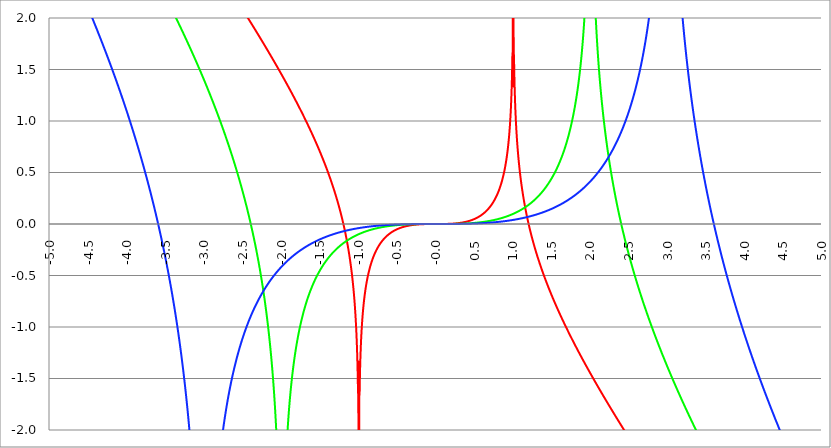
| Category | Series 1 | Series 0 | Series 2 |
|---|---|---|---|
| -5.0 | 4.797 | 4.153 | 2.921 |
| -4.995 | 4.792 | 4.147 | 2.913 |
| -4.99 | 4.787 | 4.141 | 2.905 |
| -4.985 | 4.782 | 4.135 | 2.897 |
| -4.98 | 4.776 | 4.129 | 2.889 |
| -4.975 | 4.771 | 4.123 | 2.881 |
| -4.97 | 4.766 | 4.117 | 2.874 |
| -4.965000000000001 | 4.761 | 4.111 | 2.866 |
| -4.960000000000001 | 4.756 | 4.105 | 2.858 |
| -4.955000000000001 | 4.75 | 4.099 | 2.85 |
| -4.950000000000001 | 4.745 | 4.093 | 2.842 |
| -4.945000000000001 | 4.74 | 4.087 | 2.834 |
| -4.940000000000001 | 4.735 | 4.081 | 2.826 |
| -4.935000000000001 | 4.73 | 4.075 | 2.818 |
| -4.930000000000001 | 4.724 | 4.069 | 2.81 |
| -4.925000000000002 | 4.719 | 4.063 | 2.802 |
| -4.920000000000002 | 4.714 | 4.057 | 2.794 |
| -4.915000000000002 | 4.709 | 4.051 | 2.786 |
| -4.910000000000002 | 4.703 | 4.045 | 2.778 |
| -4.905000000000002 | 4.698 | 4.039 | 2.77 |
| -4.900000000000002 | 4.693 | 4.033 | 2.762 |
| -4.895000000000002 | 4.688 | 4.027 | 2.754 |
| -4.890000000000002 | 4.683 | 4.021 | 2.746 |
| -4.885000000000002 | 4.677 | 4.015 | 2.738 |
| -4.880000000000002 | 4.672 | 4.009 | 2.73 |
| -4.875000000000003 | 4.667 | 4.003 | 2.722 |
| -4.870000000000003 | 4.662 | 3.997 | 2.714 |
| -4.865000000000003 | 4.656 | 3.991 | 2.706 |
| -4.860000000000003 | 4.651 | 3.985 | 2.698 |
| -4.855000000000003 | 4.646 | 3.979 | 2.69 |
| -4.850000000000003 | 4.641 | 3.973 | 2.682 |
| -4.845000000000003 | 4.636 | 3.967 | 2.674 |
| -4.840000000000003 | 4.63 | 3.961 | 2.666 |
| -4.835000000000003 | 4.625 | 3.955 | 2.658 |
| -4.830000000000004 | 4.62 | 3.949 | 2.65 |
| -4.825000000000004 | 4.615 | 3.943 | 2.641 |
| -4.820000000000004 | 4.609 | 3.937 | 2.633 |
| -4.815000000000004 | 4.604 | 3.931 | 2.625 |
| -4.810000000000004 | 4.599 | 3.925 | 2.617 |
| -4.805000000000004 | 4.594 | 3.919 | 2.609 |
| -4.800000000000004 | 4.589 | 3.913 | 2.6 |
| -4.795000000000004 | 4.583 | 3.907 | 2.592 |
| -4.790000000000004 | 4.578 | 3.901 | 2.584 |
| -4.785000000000004 | 4.573 | 3.895 | 2.576 |
| -4.780000000000004 | 4.568 | 3.888 | 2.568 |
| -4.775000000000004 | 4.562 | 3.882 | 2.559 |
| -4.770000000000004 | 4.557 | 3.876 | 2.551 |
| -4.765000000000005 | 4.552 | 3.87 | 2.543 |
| -4.760000000000005 | 4.547 | 3.864 | 2.534 |
| -4.755000000000005 | 4.542 | 3.858 | 2.526 |
| -4.750000000000005 | 4.536 | 3.852 | 2.518 |
| -4.745000000000005 | 4.531 | 3.846 | 2.51 |
| -4.740000000000005 | 4.526 | 3.84 | 2.501 |
| -4.735000000000005 | 4.521 | 3.834 | 2.493 |
| -4.730000000000005 | 4.515 | 3.828 | 2.485 |
| -4.725000000000006 | 4.51 | 3.822 | 2.476 |
| -4.720000000000006 | 4.505 | 3.816 | 2.468 |
| -4.715000000000006 | 4.5 | 3.809 | 2.459 |
| -4.710000000000006 | 4.494 | 3.803 | 2.451 |
| -4.705000000000006 | 4.489 | 3.797 | 2.443 |
| -4.700000000000006 | 4.484 | 3.791 | 2.434 |
| -4.695000000000006 | 4.479 | 3.785 | 2.426 |
| -4.690000000000006 | 4.473 | 3.779 | 2.417 |
| -4.685000000000007 | 4.468 | 3.773 | 2.409 |
| -4.680000000000007 | 4.463 | 3.767 | 2.4 |
| -4.675000000000007 | 4.458 | 3.761 | 2.392 |
| -4.670000000000007 | 4.453 | 3.754 | 2.383 |
| -4.665000000000007 | 4.447 | 3.748 | 2.375 |
| -4.660000000000007 | 4.442 | 3.742 | 2.366 |
| -4.655000000000007 | 4.437 | 3.736 | 2.358 |
| -4.650000000000007 | 4.432 | 3.73 | 2.349 |
| -4.645000000000007 | 4.426 | 3.724 | 2.341 |
| -4.640000000000008 | 4.421 | 3.718 | 2.332 |
| -4.635000000000008 | 4.416 | 3.712 | 2.323 |
| -4.630000000000008 | 4.411 | 3.705 | 2.315 |
| -4.625000000000008 | 4.405 | 3.699 | 2.306 |
| -4.620000000000008 | 4.4 | 3.693 | 2.297 |
| -4.615000000000008 | 4.395 | 3.687 | 2.289 |
| -4.610000000000008 | 4.39 | 3.681 | 2.28 |
| -4.605000000000008 | 4.384 | 3.675 | 2.271 |
| -4.600000000000008 | 4.379 | 3.668 | 2.263 |
| -4.595000000000009 | 4.374 | 3.662 | 2.254 |
| -4.590000000000009 | 4.369 | 3.656 | 2.245 |
| -4.585000000000009 | 4.363 | 3.65 | 2.237 |
| -4.580000000000009 | 4.358 | 3.644 | 2.228 |
| -4.57500000000001 | 4.353 | 3.638 | 2.219 |
| -4.57000000000001 | 4.348 | 3.631 | 2.21 |
| -4.565000000000009 | 4.342 | 3.625 | 2.202 |
| -4.560000000000009 | 4.337 | 3.619 | 2.193 |
| -4.555000000000009 | 4.332 | 3.613 | 2.184 |
| -4.55000000000001 | 4.327 | 3.607 | 2.175 |
| -4.54500000000001 | 4.321 | 3.6 | 2.166 |
| -4.54000000000001 | 4.316 | 3.594 | 2.157 |
| -4.53500000000001 | 4.311 | 3.588 | 2.148 |
| -4.53000000000001 | 4.306 | 3.582 | 2.14 |
| -4.52500000000001 | 4.3 | 3.576 | 2.131 |
| -4.52000000000001 | 4.295 | 3.569 | 2.122 |
| -4.51500000000001 | 4.29 | 3.563 | 2.113 |
| -4.51000000000001 | 4.285 | 3.557 | 2.104 |
| -4.505000000000011 | 4.279 | 3.551 | 2.095 |
| -4.500000000000011 | 4.274 | 3.544 | 2.086 |
| -4.495000000000011 | 4.269 | 3.538 | 2.077 |
| -4.490000000000011 | 4.263 | 3.532 | 2.068 |
| -4.485000000000011 | 4.258 | 3.526 | 2.059 |
| -4.480000000000011 | 4.253 | 3.52 | 2.05 |
| -4.475000000000011 | 4.248 | 3.513 | 2.041 |
| -4.470000000000011 | 4.242 | 3.507 | 2.032 |
| -4.465000000000011 | 4.237 | 3.501 | 2.022 |
| -4.460000000000011 | 4.232 | 3.495 | 2.013 |
| -4.455000000000012 | 4.227 | 3.488 | 2.004 |
| -4.450000000000012 | 4.221 | 3.482 | 1.995 |
| -4.445000000000012 | 4.216 | 3.476 | 1.986 |
| -4.440000000000012 | 4.211 | 3.469 | 1.977 |
| -4.435000000000012 | 4.206 | 3.463 | 1.967 |
| -4.430000000000012 | 4.2 | 3.457 | 1.958 |
| -4.425000000000012 | 4.195 | 3.451 | 1.949 |
| -4.420000000000012 | 4.19 | 3.444 | 1.94 |
| -4.415000000000012 | 4.185 | 3.438 | 1.93 |
| -4.410000000000013 | 4.179 | 3.432 | 1.921 |
| -4.405000000000013 | 4.174 | 3.425 | 1.912 |
| -4.400000000000013 | 4.169 | 3.419 | 1.902 |
| -4.395000000000013 | 4.163 | 3.413 | 1.893 |
| -4.390000000000013 | 4.158 | 3.407 | 1.884 |
| -4.385000000000013 | 4.153 | 3.4 | 1.874 |
| -4.380000000000013 | 4.148 | 3.394 | 1.865 |
| -4.375000000000013 | 4.142 | 3.388 | 1.856 |
| -4.370000000000013 | 4.137 | 3.381 | 1.846 |
| -4.365000000000013 | 4.132 | 3.375 | 1.837 |
| -4.360000000000014 | 4.126 | 3.369 | 1.827 |
| -4.355000000000014 | 4.121 | 3.362 | 1.818 |
| -4.350000000000014 | 4.116 | 3.356 | 1.808 |
| -4.345000000000014 | 4.111 | 3.35 | 1.799 |
| -4.340000000000014 | 4.105 | 3.343 | 1.789 |
| -4.335000000000014 | 4.1 | 3.337 | 1.779 |
| -4.330000000000014 | 4.095 | 3.331 | 1.77 |
| -4.325000000000014 | 4.09 | 3.324 | 1.76 |
| -4.320000000000014 | 4.084 | 3.318 | 1.751 |
| -4.315000000000015 | 4.079 | 3.311 | 1.741 |
| -4.310000000000015 | 4.074 | 3.305 | 1.731 |
| -4.305000000000015 | 4.068 | 3.299 | 1.721 |
| -4.300000000000015 | 4.063 | 3.292 | 1.712 |
| -4.295000000000015 | 4.058 | 3.286 | 1.702 |
| -4.290000000000015 | 4.053 | 3.28 | 1.692 |
| -4.285000000000015 | 4.047 | 3.273 | 1.682 |
| -4.280000000000015 | 4.042 | 3.267 | 1.673 |
| -4.275000000000015 | 4.037 | 3.26 | 1.663 |
| -4.270000000000015 | 4.031 | 3.254 | 1.653 |
| -4.265000000000016 | 4.026 | 3.248 | 1.643 |
| -4.260000000000016 | 4.021 | 3.241 | 1.633 |
| -4.255000000000016 | 4.016 | 3.235 | 1.623 |
| -4.250000000000016 | 4.01 | 3.228 | 1.613 |
| -4.245000000000016 | 4.005 | 3.222 | 1.603 |
| -4.240000000000016 | 4 | 3.215 | 1.593 |
| -4.235000000000016 | 3.994 | 3.209 | 1.583 |
| -4.230000000000016 | 3.989 | 3.203 | 1.573 |
| -4.225000000000017 | 3.984 | 3.196 | 1.563 |
| -4.220000000000017 | 3.978 | 3.19 | 1.553 |
| -4.215000000000017 | 3.973 | 3.183 | 1.543 |
| -4.210000000000017 | 3.968 | 3.177 | 1.533 |
| -4.205000000000017 | 3.963 | 3.17 | 1.523 |
| -4.200000000000017 | 3.957 | 3.164 | 1.512 |
| -4.195000000000017 | 3.952 | 3.157 | 1.502 |
| -4.190000000000017 | 3.947 | 3.151 | 1.492 |
| -4.185000000000017 | 3.941 | 3.144 | 1.482 |
| -4.180000000000017 | 3.936 | 3.138 | 1.471 |
| -4.175000000000018 | 3.931 | 3.132 | 1.461 |
| -4.170000000000018 | 3.925 | 3.125 | 1.451 |
| -4.165000000000018 | 3.92 | 3.119 | 1.44 |
| -4.160000000000018 | 3.915 | 3.112 | 1.43 |
| -4.155000000000018 | 3.91 | 3.106 | 1.419 |
| -4.150000000000018 | 3.904 | 3.099 | 1.409 |
| -4.145000000000018 | 3.899 | 3.093 | 1.398 |
| -4.140000000000018 | 3.894 | 3.086 | 1.388 |
| -4.135000000000018 | 3.888 | 3.079 | 1.377 |
| -4.130000000000019 | 3.883 | 3.073 | 1.367 |
| -4.125000000000019 | 3.878 | 3.066 | 1.356 |
| -4.120000000000019 | 3.872 | 3.06 | 1.346 |
| -4.115000000000019 | 3.867 | 3.053 | 1.335 |
| -4.110000000000019 | 3.862 | 3.047 | 1.324 |
| -4.105000000000019 | 3.856 | 3.04 | 1.314 |
| -4.100000000000019 | 3.851 | 3.034 | 1.303 |
| -4.095000000000019 | 3.846 | 3.027 | 1.292 |
| -4.090000000000019 | 3.84 | 3.021 | 1.281 |
| -4.085000000000019 | 3.835 | 3.014 | 1.27 |
| -4.08000000000002 | 3.83 | 3.007 | 1.26 |
| -4.07500000000002 | 3.824 | 3.001 | 1.249 |
| -4.07000000000002 | 3.819 | 2.994 | 1.238 |
| -4.06500000000002 | 3.814 | 2.988 | 1.227 |
| -4.06000000000002 | 3.809 | 2.981 | 1.216 |
| -4.05500000000002 | 3.803 | 2.974 | 1.205 |
| -4.05000000000002 | 3.798 | 2.968 | 1.194 |
| -4.04500000000002 | 3.793 | 2.961 | 1.183 |
| -4.04000000000002 | 3.787 | 2.955 | 1.171 |
| -4.03500000000002 | 3.782 | 2.948 | 1.16 |
| -4.03000000000002 | 3.777 | 2.941 | 1.149 |
| -4.025000000000021 | 3.771 | 2.935 | 1.138 |
| -4.020000000000021 | 3.766 | 2.928 | 1.127 |
| -4.015000000000021 | 3.761 | 2.921 | 1.115 |
| -4.010000000000021 | 3.755 | 2.915 | 1.104 |
| -4.005000000000021 | 3.75 | 2.908 | 1.093 |
| -4.000000000000021 | 3.745 | 2.901 | 1.081 |
| -3.995000000000021 | 3.739 | 2.895 | 1.07 |
| -3.990000000000021 | 3.734 | 2.888 | 1.058 |
| -3.985000000000022 | 3.729 | 2.881 | 1.047 |
| -3.980000000000022 | 3.723 | 2.875 | 1.035 |
| -3.975000000000022 | 3.718 | 2.868 | 1.024 |
| -3.970000000000022 | 3.713 | 2.861 | 1.012 |
| -3.965000000000022 | 3.707 | 2.855 | 1 |
| -3.960000000000022 | 3.702 | 2.848 | 0.988 |
| -3.955000000000022 | 3.697 | 2.841 | 0.977 |
| -3.950000000000022 | 3.691 | 2.834 | 0.965 |
| -3.945000000000022 | 3.686 | 2.828 | 0.953 |
| -3.940000000000023 | 3.681 | 2.821 | 0.941 |
| -3.935000000000023 | 3.675 | 2.814 | 0.929 |
| -3.930000000000023 | 3.67 | 2.807 | 0.917 |
| -3.925000000000023 | 3.664 | 2.801 | 0.905 |
| -3.920000000000023 | 3.659 | 2.794 | 0.893 |
| -3.915000000000023 | 3.654 | 2.787 | 0.881 |
| -3.910000000000023 | 3.648 | 2.78 | 0.869 |
| -3.905000000000023 | 3.643 | 2.774 | 0.857 |
| -3.900000000000023 | 3.638 | 2.767 | 0.845 |
| -3.895000000000023 | 3.632 | 2.76 | 0.832 |
| -3.890000000000024 | 3.627 | 2.753 | 0.82 |
| -3.885000000000024 | 3.622 | 2.747 | 0.808 |
| -3.880000000000024 | 3.616 | 2.74 | 0.795 |
| -3.875000000000024 | 3.611 | 2.733 | 0.783 |
| -3.870000000000024 | 3.606 | 2.726 | 0.77 |
| -3.865000000000024 | 3.6 | 2.719 | 0.758 |
| -3.860000000000024 | 3.595 | 2.712 | 0.745 |
| -3.855000000000024 | 3.59 | 2.706 | 0.733 |
| -3.850000000000024 | 3.584 | 2.699 | 0.72 |
| -3.845000000000025 | 3.579 | 2.692 | 0.707 |
| -3.840000000000025 | 3.573 | 2.685 | 0.694 |
| -3.835000000000025 | 3.568 | 2.678 | 0.681 |
| -3.830000000000025 | 3.563 | 2.671 | 0.669 |
| -3.825000000000025 | 3.557 | 2.664 | 0.656 |
| -3.820000000000025 | 3.552 | 2.658 | 0.643 |
| -3.815000000000025 | 3.547 | 2.651 | 0.629 |
| -3.810000000000025 | 3.541 | 2.644 | 0.616 |
| -3.805000000000025 | 3.536 | 2.637 | 0.603 |
| -3.800000000000026 | 3.531 | 2.63 | 0.59 |
| -3.795000000000026 | 3.525 | 2.623 | 0.577 |
| -3.790000000000026 | 3.52 | 2.616 | 0.563 |
| -3.785000000000026 | 3.514 | 2.609 | 0.55 |
| -3.780000000000026 | 3.509 | 2.602 | 0.536 |
| -3.775000000000026 | 3.504 | 2.595 | 0.523 |
| -3.770000000000026 | 3.498 | 2.588 | 0.509 |
| -3.765000000000026 | 3.493 | 2.581 | 0.496 |
| -3.760000000000026 | 3.487 | 2.574 | 0.482 |
| -3.755000000000026 | 3.482 | 2.567 | 0.468 |
| -3.750000000000027 | 3.477 | 2.56 | 0.454 |
| -3.745000000000027 | 3.471 | 2.553 | 0.44 |
| -3.740000000000027 | 3.466 | 2.546 | 0.426 |
| -3.735000000000027 | 3.461 | 2.539 | 0.412 |
| -3.730000000000027 | 3.455 | 2.532 | 0.398 |
| -3.725000000000027 | 3.45 | 2.525 | 0.384 |
| -3.720000000000027 | 3.444 | 2.518 | 0.37 |
| -3.715000000000027 | 3.439 | 2.511 | 0.355 |
| -3.710000000000027 | 3.434 | 2.504 | 0.341 |
| -3.705000000000028 | 3.428 | 2.497 | 0.326 |
| -3.700000000000028 | 3.423 | 2.49 | 0.312 |
| -3.695000000000028 | 3.417 | 2.483 | 0.297 |
| -3.690000000000028 | 3.412 | 2.476 | 0.282 |
| -3.685000000000028 | 3.407 | 2.469 | 0.268 |
| -3.680000000000028 | 3.401 | 2.462 | 0.253 |
| -3.675000000000028 | 3.396 | 2.455 | 0.238 |
| -3.670000000000028 | 3.39 | 2.448 | 0.223 |
| -3.665000000000028 | 3.385 | 2.441 | 0.208 |
| -3.660000000000028 | 3.38 | 2.433 | 0.193 |
| -3.655000000000029 | 3.374 | 2.426 | 0.177 |
| -3.650000000000029 | 3.369 | 2.419 | 0.162 |
| -3.645000000000029 | 3.363 | 2.412 | 0.146 |
| -3.640000000000029 | 3.358 | 2.405 | 0.131 |
| -3.635000000000029 | 3.353 | 2.398 | 0.115 |
| -3.630000000000029 | 3.347 | 2.39 | 0.1 |
| -3.625000000000029 | 3.342 | 2.383 | 0.084 |
| -3.620000000000029 | 3.336 | 2.376 | 0.068 |
| -3.615000000000029 | 3.331 | 2.369 | 0.052 |
| -3.61000000000003 | 3.326 | 2.362 | 0.036 |
| -3.60500000000003 | 3.32 | 2.354 | 0.019 |
| -3.60000000000003 | 3.315 | 2.347 | 0.003 |
| -3.59500000000003 | 3.309 | 2.34 | -0.013 |
| -3.59000000000003 | 3.304 | 2.333 | -0.03 |
| -3.58500000000003 | 3.298 | 2.325 | -0.046 |
| -3.58000000000003 | 3.293 | 2.318 | -0.063 |
| -3.57500000000003 | 3.288 | 2.311 | -0.08 |
| -3.57000000000003 | 3.282 | 2.304 | -0.097 |
| -3.565000000000031 | 3.277 | 2.296 | -0.114 |
| -3.560000000000031 | 3.271 | 2.289 | -0.131 |
| -3.555000000000031 | 3.266 | 2.282 | -0.149 |
| -3.550000000000031 | 3.26 | 2.274 | -0.166 |
| -3.545000000000031 | 3.255 | 2.267 | -0.184 |
| -3.540000000000031 | 3.25 | 2.26 | -0.201 |
| -3.535000000000031 | 3.244 | 2.252 | -0.219 |
| -3.530000000000031 | 3.239 | 2.245 | -0.237 |
| -3.525000000000031 | 3.233 | 2.238 | -0.255 |
| -3.520000000000032 | 3.228 | 2.23 | -0.273 |
| -3.515000000000032 | 3.222 | 2.223 | -0.292 |
| -3.510000000000032 | 3.217 | 2.216 | -0.31 |
| -3.505000000000032 | 3.212 | 2.208 | -0.329 |
| -3.500000000000032 | 3.206 | 2.201 | -0.347 |
| -3.495000000000032 | 3.201 | 2.193 | -0.366 |
| -3.490000000000032 | 3.195 | 2.186 | -0.385 |
| -3.485000000000032 | 3.19 | 2.178 | -0.405 |
| -3.480000000000032 | 3.184 | 2.171 | -0.424 |
| -3.475000000000032 | 3.179 | 2.163 | -0.444 |
| -3.470000000000033 | 3.173 | 2.156 | -0.463 |
| -3.465000000000033 | 3.168 | 2.148 | -0.483 |
| -3.460000000000033 | 3.163 | 2.141 | -0.503 |
| -3.455000000000033 | 3.157 | 2.133 | -0.523 |
| -3.450000000000033 | 3.152 | 2.126 | -0.544 |
| -3.445000000000033 | 3.146 | 2.118 | -0.564 |
| -3.440000000000033 | 3.141 | 2.111 | -0.585 |
| -3.435000000000033 | 3.135 | 2.103 | -0.606 |
| -3.430000000000033 | 3.13 | 2.096 | -0.627 |
| -3.425000000000034 | 3.124 | 2.088 | -0.649 |
| -3.420000000000034 | 3.119 | 2.081 | -0.67 |
| -3.415000000000034 | 3.113 | 2.073 | -0.692 |
| -3.410000000000034 | 3.108 | 2.065 | -0.714 |
| -3.405000000000034 | 3.102 | 2.058 | -0.736 |
| -3.400000000000034 | 3.097 | 2.05 | -0.759 |
| -3.395000000000034 | 3.091 | 2.042 | -0.782 |
| -3.390000000000034 | 3.086 | 2.035 | -0.805 |
| -3.385000000000034 | 3.081 | 2.027 | -0.828 |
| -3.380000000000034 | 3.075 | 2.019 | -0.851 |
| -3.375000000000035 | 3.07 | 2.012 | -0.875 |
| -3.370000000000035 | 3.064 | 2.004 | -0.899 |
| -3.365000000000035 | 3.059 | 1.996 | -0.923 |
| -3.360000000000035 | 3.053 | 1.989 | -0.948 |
| -3.355000000000035 | 3.048 | 1.981 | -0.972 |
| -3.350000000000035 | 3.042 | 1.973 | -0.997 |
| -3.345000000000035 | 3.037 | 1.965 | -1.023 |
| -3.340000000000035 | 3.031 | 1.957 | -1.049 |
| -3.335000000000035 | 3.026 | 1.95 | -1.075 |
| -3.330000000000036 | 3.02 | 1.942 | -1.101 |
| -3.325000000000036 | 3.015 | 1.934 | -1.128 |
| -3.320000000000036 | 3.009 | 1.926 | -1.155 |
| -3.315000000000036 | 3.004 | 1.918 | -1.182 |
| -3.310000000000036 | 2.998 | 1.91 | -1.21 |
| -3.305000000000036 | 2.993 | 1.903 | -1.238 |
| -3.300000000000036 | 2.987 | 1.895 | -1.267 |
| -3.295000000000036 | 2.982 | 1.887 | -1.296 |
| -3.290000000000036 | 2.976 | 1.879 | -1.325 |
| -3.285000000000036 | 2.971 | 1.871 | -1.355 |
| -3.280000000000036 | 2.965 | 1.863 | -1.386 |
| -3.275000000000037 | 2.96 | 1.855 | -1.416 |
| -3.270000000000037 | 2.954 | 1.847 | -1.448 |
| -3.265000000000037 | 2.949 | 1.839 | -1.48 |
| -3.260000000000037 | 2.943 | 1.831 | -1.512 |
| -3.255000000000037 | 2.938 | 1.823 | -1.545 |
| -3.250000000000037 | 2.932 | 1.815 | -1.578 |
| -3.245000000000037 | 2.926 | 1.807 | -1.612 |
| -3.240000000000037 | 2.921 | 1.799 | -1.647 |
| -3.235000000000038 | 2.915 | 1.791 | -1.683 |
| -3.230000000000038 | 2.91 | 1.783 | -1.719 |
| -3.225000000000038 | 2.904 | 1.774 | -1.755 |
| -3.220000000000038 | 2.899 | 1.766 | -1.793 |
| -3.215000000000038 | 2.893 | 1.758 | -1.831 |
| -3.210000000000038 | 2.888 | 1.75 | -1.87 |
| -3.205000000000038 | 2.882 | 1.742 | -1.91 |
| -3.200000000000038 | 2.877 | 1.734 | -1.951 |
| -3.195000000000038 | 2.871 | 1.725 | -1.993 |
| -3.190000000000039 | 2.866 | 1.717 | -2.035 |
| -3.185000000000039 | 2.86 | 1.709 | -2.079 |
| -3.180000000000039 | 2.855 | 1.701 | -2.124 |
| -3.175000000000039 | 2.849 | 1.692 | -2.17 |
| -3.170000000000039 | 2.843 | 1.684 | -2.217 |
| -3.16500000000004 | 2.838 | 1.676 | -2.266 |
| -3.16000000000004 | 2.832 | 1.667 | -2.316 |
| -3.155000000000039 | 2.827 | 1.659 | -2.367 |
| -3.150000000000039 | 2.821 | 1.651 | -2.42 |
| -3.14500000000004 | 2.816 | 1.642 | -2.475 |
| -3.14000000000004 | 2.81 | 1.634 | -2.531 |
| -3.13500000000004 | 2.804 | 1.626 | -2.59 |
| -3.13000000000004 | 2.799 | 1.617 | -2.65 |
| -3.12500000000004 | 2.793 | 1.609 | -2.713 |
| -3.12000000000004 | 2.788 | 1.6 | -2.778 |
| -3.11500000000004 | 2.782 | 1.592 | -2.845 |
| -3.11000000000004 | 2.777 | 1.583 | -2.916 |
| -3.10500000000004 | 2.771 | 1.575 | -2.989 |
| -3.10000000000004 | 2.765 | 1.566 | -3.066 |
| -3.095000000000041 | 2.76 | 1.557 | -3.147 |
| -3.090000000000041 | 2.754 | 1.549 | -3.232 |
| -3.085000000000041 | 2.749 | 1.54 | -3.321 |
| -3.080000000000041 | 2.743 | 1.532 | -3.416 |
| -3.075000000000041 | 2.738 | 1.523 | -3.517 |
| -3.070000000000041 | 2.732 | 1.514 | -3.624 |
| -3.065000000000041 | 2.726 | 1.506 | -3.739 |
| -3.060000000000041 | 2.721 | 1.497 | -3.863 |
| -3.055000000000041 | 2.715 | 1.488 | -3.997 |
| -3.050000000000042 | 2.71 | 1.479 | -4.144 |
| -3.045000000000042 | 2.704 | 1.471 | -4.305 |
| -3.040000000000042 | 2.698 | 1.462 | -4.486 |
| -3.035000000000042 | 2.693 | 1.453 | -4.69 |
| -3.030000000000042 | 2.687 | 1.444 | -4.925 |
| -3.025000000000042 | 2.682 | 1.435 | -5.202 |
| -3.020000000000042 | 2.676 | 1.426 | -5.541 |
| -3.015000000000042 | 2.67 | 1.417 | -5.976 |
| -3.010000000000042 | 2.665 | 1.409 | -6.588 |
| -3.005000000000043 | 2.659 | 1.4 | -7.631 |
| -3.000000000000043 | 2.653 | 1.391 | -45.867 |
| -2.995000000000043 | 2.648 | 1.382 | -7.639 |
| -2.990000000000043 | 2.642 | 1.373 | -6.603 |
| -2.985000000000043 | 2.637 | 1.363 | -5.998 |
| -2.980000000000043 | 2.631 | 1.354 | -5.571 |
| -2.975000000000043 | 2.625 | 1.345 | -5.24 |
| -2.970000000000043 | 2.62 | 1.336 | -4.97 |
| -2.965000000000043 | 2.614 | 1.327 | -4.742 |
| -2.960000000000043 | 2.608 | 1.318 | -4.546 |
| -2.955000000000044 | 2.603 | 1.309 | -4.373 |
| -2.950000000000044 | 2.597 | 1.299 | -4.219 |
| -2.945000000000044 | 2.591 | 1.29 | -4.079 |
| -2.940000000000044 | 2.586 | 1.281 | -3.953 |
| -2.935000000000044 | 2.58 | 1.271 | -3.836 |
| -2.930000000000044 | 2.574 | 1.262 | -3.729 |
| -2.925000000000044 | 2.569 | 1.253 | -3.629 |
| -2.920000000000044 | 2.563 | 1.243 | -3.536 |
| -2.915000000000044 | 2.557 | 1.234 | -3.449 |
| -2.910000000000045 | 2.552 | 1.224 | -3.367 |
| -2.905000000000045 | 2.546 | 1.215 | -3.29 |
| -2.900000000000045 | 2.54 | 1.205 | -3.216 |
| -2.895000000000045 | 2.535 | 1.196 | -3.147 |
| -2.890000000000045 | 2.529 | 1.186 | -3.081 |
| -2.885000000000045 | 2.523 | 1.177 | -3.018 |
| -2.880000000000045 | 2.518 | 1.167 | -2.958 |
| -2.875000000000045 | 2.512 | 1.157 | -2.9 |
| -2.870000000000045 | 2.506 | 1.148 | -2.845 |
| -2.865000000000045 | 2.501 | 1.138 | -2.792 |
| -2.860000000000046 | 2.495 | 1.128 | -2.741 |
| -2.855000000000046 | 2.489 | 1.118 | -2.692 |
| -2.850000000000046 | 2.484 | 1.109 | -2.645 |
| -2.845000000000046 | 2.478 | 1.099 | -2.6 |
| -2.840000000000046 | 2.472 | 1.089 | -2.556 |
| -2.835000000000046 | 2.466 | 1.079 | -2.514 |
| -2.830000000000046 | 2.461 | 1.069 | -2.472 |
| -2.825000000000046 | 2.455 | 1.059 | -2.433 |
| -2.820000000000046 | 2.449 | 1.049 | -2.394 |
| -2.815000000000047 | 2.444 | 1.039 | -2.357 |
| -2.810000000000047 | 2.438 | 1.029 | -2.32 |
| -2.805000000000047 | 2.432 | 1.018 | -2.285 |
| -2.800000000000047 | 2.426 | 1.008 | -2.251 |
| -2.795000000000047 | 2.421 | 0.998 | -2.218 |
| -2.790000000000047 | 2.415 | 0.988 | -2.185 |
| -2.785000000000047 | 2.409 | 0.977 | -2.154 |
| -2.780000000000047 | 2.403 | 0.967 | -2.123 |
| -2.775000000000047 | 2.398 | 0.957 | -2.093 |
| -2.770000000000047 | 2.392 | 0.946 | -2.064 |
| -2.765000000000048 | 2.386 | 0.936 | -2.035 |
| -2.760000000000048 | 2.38 | 0.925 | -2.007 |
| -2.755000000000048 | 2.375 | 0.915 | -1.98 |
| -2.750000000000048 | 2.369 | 0.904 | -1.953 |
| -2.745000000000048 | 2.363 | 0.894 | -1.927 |
| -2.740000000000048 | 2.357 | 0.883 | -1.902 |
| -2.735000000000048 | 2.352 | 0.872 | -1.877 |
| -2.730000000000048 | 2.346 | 0.861 | -1.853 |
| -2.725000000000048 | 2.34 | 0.851 | -1.829 |
| -2.720000000000049 | 2.334 | 0.84 | -1.805 |
| -2.715000000000049 | 2.329 | 0.829 | -1.783 |
| -2.710000000000049 | 2.323 | 0.818 | -1.76 |
| -2.705000000000049 | 2.317 | 0.807 | -1.738 |
| -2.700000000000049 | 2.311 | 0.796 | -1.717 |
| -2.695000000000049 | 2.305 | 0.785 | -1.696 |
| -2.690000000000049 | 2.3 | 0.774 | -1.675 |
| -2.685000000000049 | 2.294 | 0.762 | -1.655 |
| -2.680000000000049 | 2.288 | 0.751 | -1.635 |
| -2.675000000000049 | 2.282 | 0.74 | -1.615 |
| -2.67000000000005 | 2.276 | 0.728 | -1.596 |
| -2.66500000000005 | 2.27 | 0.717 | -1.577 |
| -2.66000000000005 | 2.265 | 0.705 | -1.558 |
| -2.65500000000005 | 2.259 | 0.694 | -1.54 |
| -2.65000000000005 | 2.253 | 0.682 | -1.522 |
| -2.64500000000005 | 2.247 | 0.671 | -1.505 |
| -2.64000000000005 | 2.241 | 0.659 | -1.487 |
| -2.63500000000005 | 2.236 | 0.647 | -1.47 |
| -2.63000000000005 | 2.23 | 0.635 | -1.454 |
| -2.625000000000051 | 2.224 | 0.624 | -1.437 |
| -2.620000000000051 | 2.218 | 0.612 | -1.421 |
| -2.615000000000051 | 2.212 | 0.6 | -1.405 |
| -2.610000000000051 | 2.206 | 0.587 | -1.389 |
| -2.605000000000051 | 2.2 | 0.575 | -1.374 |
| -2.600000000000051 | 2.195 | 0.563 | -1.359 |
| -2.595000000000051 | 2.189 | 0.551 | -1.344 |
| -2.590000000000051 | 2.183 | 0.538 | -1.329 |
| -2.585000000000051 | 2.177 | 0.526 | -1.314 |
| -2.580000000000052 | 2.171 | 0.514 | -1.3 |
| -2.575000000000052 | 2.165 | 0.501 | -1.286 |
| -2.570000000000052 | 2.159 | 0.488 | -1.272 |
| -2.565000000000052 | 2.153 | 0.476 | -1.258 |
| -2.560000000000052 | 2.147 | 0.463 | -1.245 |
| -2.555000000000052 | 2.142 | 0.45 | -1.232 |
| -2.550000000000052 | 2.136 | 0.437 | -1.218 |
| -2.545000000000052 | 2.13 | 0.424 | -1.206 |
| -2.540000000000052 | 2.124 | 0.411 | -1.193 |
| -2.535000000000053 | 2.118 | 0.398 | -1.18 |
| -2.530000000000053 | 2.112 | 0.384 | -1.168 |
| -2.525000000000053 | 2.106 | 0.371 | -1.156 |
| -2.520000000000053 | 2.1 | 0.358 | -1.144 |
| -2.515000000000053 | 2.094 | 0.344 | -1.132 |
| -2.510000000000053 | 2.088 | 0.33 | -1.12 |
| -2.505000000000053 | 2.082 | 0.317 | -1.108 |
| -2.500000000000053 | 2.076 | 0.303 | -1.097 |
| -2.495000000000053 | 2.07 | 0.289 | -1.086 |
| -2.490000000000053 | 2.064 | 0.275 | -1.074 |
| -2.485000000000054 | 2.058 | 0.261 | -1.063 |
| -2.480000000000054 | 2.053 | 0.246 | -1.053 |
| -2.475000000000054 | 2.047 | 0.232 | -1.042 |
| -2.470000000000054 | 2.041 | 0.218 | -1.031 |
| -2.465000000000054 | 2.035 | 0.203 | -1.021 |
| -2.460000000000054 | 2.029 | 0.188 | -1.01 |
| -2.455000000000054 | 2.023 | 0.174 | -1 |
| -2.450000000000054 | 2.017 | 0.159 | -0.99 |
| -2.445000000000054 | 2.011 | 0.144 | -0.98 |
| -2.440000000000055 | 2.005 | 0.128 | -0.97 |
| -2.435000000000055 | 1.999 | 0.113 | -0.961 |
| -2.430000000000055 | 1.993 | 0.098 | -0.951 |
| -2.425000000000055 | 1.987 | 0.082 | -0.942 |
| -2.420000000000055 | 1.981 | 0.066 | -0.932 |
| -2.415000000000055 | 1.974 | 0.051 | -0.923 |
| -2.410000000000055 | 1.968 | 0.035 | -0.914 |
| -2.405000000000055 | 1.962 | 0.018 | -0.905 |
| -2.400000000000055 | 1.956 | 0.002 | -0.896 |
| -2.395000000000055 | 1.95 | -0.014 | -0.887 |
| -2.390000000000056 | 1.944 | -0.031 | -0.878 |
| -2.385000000000056 | 1.938 | -0.048 | -0.87 |
| -2.380000000000056 | 1.932 | -0.065 | -0.861 |
| -2.375000000000056 | 1.926 | -0.082 | -0.853 |
| -2.370000000000056 | 1.92 | -0.099 | -0.844 |
| -2.365000000000056 | 1.914 | -0.116 | -0.836 |
| -2.360000000000056 | 1.908 | -0.134 | -0.828 |
| -2.355000000000056 | 1.902 | -0.152 | -0.82 |
| -2.350000000000056 | 1.896 | -0.17 | -0.812 |
| -2.345000000000057 | 1.889 | -0.188 | -0.804 |
| -2.340000000000057 | 1.883 | -0.207 | -0.796 |
| -2.335000000000057 | 1.877 | -0.225 | -0.788 |
| -2.330000000000057 | 1.871 | -0.244 | -0.781 |
| -2.325000000000057 | 1.865 | -0.263 | -0.773 |
| -2.320000000000057 | 1.859 | -0.283 | -0.766 |
| -2.315000000000057 | 1.853 | -0.302 | -0.758 |
| -2.310000000000057 | 1.847 | -0.322 | -0.751 |
| -2.305000000000057 | 1.84 | -0.342 | -0.744 |
| -2.300000000000058 | 1.834 | -0.363 | -0.737 |
| -2.295000000000058 | 1.828 | -0.383 | -0.729 |
| -2.290000000000058 | 1.822 | -0.404 | -0.722 |
| -2.285000000000058 | 1.816 | -0.425 | -0.716 |
| -2.280000000000058 | 1.81 | -0.447 | -0.709 |
| -2.275000000000058 | 1.803 | -0.469 | -0.702 |
| -2.270000000000058 | 1.797 | -0.491 | -0.695 |
| -2.265000000000058 | 1.791 | -0.513 | -0.688 |
| -2.260000000000058 | 1.785 | -0.536 | -0.682 |
| -2.255000000000058 | 1.778 | -0.56 | -0.675 |
| -2.250000000000059 | 1.772 | -0.583 | -0.669 |
| -2.245000000000059 | 1.766 | -0.607 | -0.662 |
| -2.240000000000059 | 1.76 | -0.632 | -0.656 |
| -2.235000000000059 | 1.754 | -0.657 | -0.65 |
| -2.23000000000006 | 1.747 | -0.682 | -0.644 |
| -2.22500000000006 | 1.741 | -0.708 | -0.638 |
| -2.22000000000006 | 1.735 | -0.734 | -0.631 |
| -2.215000000000059 | 1.728 | -0.761 | -0.625 |
| -2.210000000000059 | 1.722 | -0.788 | -0.619 |
| -2.20500000000006 | 1.716 | -0.816 | -0.614 |
| -2.20000000000006 | 1.71 | -0.845 | -0.608 |
| -2.19500000000006 | 1.703 | -0.874 | -0.602 |
| -2.19000000000006 | 1.697 | -0.903 | -0.596 |
| -2.18500000000006 | 1.691 | -0.934 | -0.591 |
| -2.18000000000006 | 1.684 | -0.965 | -0.585 |
| -2.17500000000006 | 1.678 | -0.997 | -0.579 |
| -2.17000000000006 | 1.672 | -1.03 | -0.574 |
| -2.16500000000006 | 1.665 | -1.064 | -0.568 |
| -2.160000000000061 | 1.659 | -1.098 | -0.563 |
| -2.155000000000061 | 1.653 | -1.134 | -0.558 |
| -2.150000000000061 | 1.646 | -1.17 | -0.552 |
| -2.145000000000061 | 1.64 | -1.208 | -0.547 |
| -2.140000000000061 | 1.633 | -1.247 | -0.542 |
| -2.135000000000061 | 1.627 | -1.287 | -0.537 |
| -2.130000000000061 | 1.621 | -1.328 | -0.532 |
| -2.125000000000061 | 1.614 | -1.372 | -0.526 |
| -2.120000000000061 | 1.608 | -1.416 | -0.521 |
| -2.115000000000061 | 1.601 | -1.462 | -0.517 |
| -2.110000000000062 | 1.595 | -1.511 | -0.512 |
| -2.105000000000062 | 1.588 | -1.561 | -0.507 |
| -2.100000000000062 | 1.582 | -1.614 | -0.502 |
| -2.095000000000062 | 1.575 | -1.669 | -0.497 |
| -2.090000000000062 | 1.569 | -1.726 | -0.492 |
| -2.085000000000062 | 1.563 | -1.787 | -0.488 |
| -2.080000000000062 | 1.556 | -1.852 | -0.483 |
| -2.075000000000062 | 1.55 | -1.92 | -0.478 |
| -2.070000000000062 | 1.543 | -1.993 | -0.474 |
| -2.065000000000063 | 1.536 | -2.071 | -0.469 |
| -2.060000000000063 | 1.53 | -2.155 | -0.465 |
| -2.055000000000063 | 1.523 | -2.245 | -0.46 |
| -2.050000000000063 | 1.517 | -2.344 | -0.456 |
| -2.045000000000063 | 1.51 | -2.454 | -0.452 |
| -2.040000000000063 | 1.504 | -2.575 | -0.447 |
| -2.035000000000063 | 1.497 | -2.712 | -0.443 |
| -2.030000000000063 | 1.49 | -2.87 | -0.439 |
| -2.025000000000063 | 1.484 | -3.056 | -0.435 |
| -2.020000000000064 | 1.477 | -3.283 | -0.43 |
| -2.015000000000064 | 1.471 | -3.575 | -0.426 |
| -2.010000000000064 | 1.464 | -3.984 | -0.422 |
| -2.005000000000064 | 1.457 | -4.681 | -0.418 |
| -2.000000000000064 | 1.451 | -29.767 | -0.414 |
| -1.995000000000064 | 1.444 | -4.688 | -0.41 |
| -1.990000000000064 | 1.437 | -3.999 | -0.406 |
| -1.985000000000064 | 1.431 | -3.597 | -0.402 |
| -1.980000000000064 | 1.424 | -3.313 | -0.398 |
| -1.975000000000064 | 1.417 | -3.094 | -0.395 |
| -1.970000000000065 | 1.41 | -2.915 | -0.391 |
| -1.965000000000065 | 1.404 | -2.765 | -0.387 |
| -1.960000000000065 | 1.397 | -2.635 | -0.383 |
| -1.955000000000065 | 1.39 | -2.521 | -0.38 |
| -1.950000000000065 | 1.383 | -2.419 | -0.376 |
| -1.945000000000065 | 1.377 | -2.328 | -0.372 |
| -1.940000000000065 | 1.37 | -2.245 | -0.369 |
| -1.935000000000065 | 1.363 | -2.168 | -0.365 |
| -1.930000000000065 | 1.356 | -2.098 | -0.362 |
| -1.925000000000066 | 1.349 | -2.033 | -0.358 |
| -1.920000000000066 | 1.343 | -1.972 | -0.355 |
| -1.915000000000066 | 1.336 | -1.915 | -0.351 |
| -1.910000000000066 | 1.329 | -1.861 | -0.348 |
| -1.905000000000066 | 1.322 | -1.811 | -0.344 |
| -1.900000000000066 | 1.315 | -1.764 | -0.341 |
| -1.895000000000066 | 1.308 | -1.718 | -0.338 |
| -1.890000000000066 | 1.301 | -1.676 | -0.334 |
| -1.885000000000066 | 1.294 | -1.635 | -0.331 |
| -1.880000000000066 | 1.287 | -1.596 | -0.328 |
| -1.875000000000067 | 1.28 | -1.559 | -0.325 |
| -1.870000000000067 | 1.273 | -1.523 | -0.321 |
| -1.865000000000067 | 1.266 | -1.489 | -0.318 |
| -1.860000000000067 | 1.259 | -1.457 | -0.315 |
| -1.855000000000067 | 1.252 | -1.425 | -0.312 |
| -1.850000000000067 | 1.245 | -1.395 | -0.309 |
| -1.845000000000067 | 1.238 | -1.366 | -0.306 |
| -1.840000000000067 | 1.231 | -1.338 | -0.303 |
| -1.835000000000067 | 1.224 | -1.311 | -0.3 |
| -1.830000000000068 | 1.217 | -1.285 | -0.297 |
| -1.825000000000068 | 1.21 | -1.26 | -0.294 |
| -1.820000000000068 | 1.202 | -1.235 | -0.291 |
| -1.815000000000068 | 1.195 | -1.211 | -0.288 |
| -1.810000000000068 | 1.188 | -1.188 | -0.285 |
| -1.805000000000068 | 1.181 | -1.166 | -0.282 |
| -1.800000000000068 | 1.174 | -1.144 | -0.279 |
| -1.795000000000068 | 1.166 | -1.123 | -0.277 |
| -1.790000000000068 | 1.159 | -1.103 | -0.274 |
| -1.785000000000068 | 1.152 | -1.083 | -0.271 |
| -1.780000000000069 | 1.145 | -1.064 | -0.268 |
| -1.775000000000069 | 1.137 | -1.045 | -0.266 |
| -1.770000000000069 | 1.13 | -1.027 | -0.263 |
| -1.765000000000069 | 1.123 | -1.009 | -0.26 |
| -1.760000000000069 | 1.115 | -0.992 | -0.258 |
| -1.75500000000007 | 1.108 | -0.975 | -0.255 |
| -1.75000000000007 | 1.1 | -0.958 | -0.253 |
| -1.745000000000069 | 1.093 | -0.942 | -0.25 |
| -1.740000000000069 | 1.085 | -0.926 | -0.247 |
| -1.73500000000007 | 1.078 | -0.911 | -0.245 |
| -1.73000000000007 | 1.07 | -0.896 | -0.242 |
| -1.72500000000007 | 1.063 | -0.881 | -0.24 |
| -1.72000000000007 | 1.055 | -0.867 | -0.237 |
| -1.71500000000007 | 1.048 | -0.853 | -0.235 |
| -1.71000000000007 | 1.04 | -0.839 | -0.233 |
| -1.70500000000007 | 1.033 | -0.825 | -0.23 |
| -1.70000000000007 | 1.025 | -0.812 | -0.228 |
| -1.69500000000007 | 1.017 | -0.799 | -0.225 |
| -1.69000000000007 | 1.01 | -0.787 | -0.223 |
| -1.685000000000071 | 1.002 | -0.774 | -0.221 |
| -1.680000000000071 | 0.994 | -0.762 | -0.218 |
| -1.675000000000071 | 0.987 | -0.75 | -0.216 |
| -1.670000000000071 | 0.979 | -0.739 | -0.214 |
| -1.665000000000071 | 0.971 | -0.727 | -0.212 |
| -1.660000000000071 | 0.963 | -0.716 | -0.21 |
| -1.655000000000071 | 0.955 | -0.705 | -0.207 |
| -1.650000000000071 | 0.947 | -0.695 | -0.205 |
| -1.645000000000071 | 0.939 | -0.684 | -0.203 |
| -1.640000000000072 | 0.931 | -0.674 | -0.201 |
| -1.635000000000072 | 0.923 | -0.663 | -0.199 |
| -1.630000000000072 | 0.915 | -0.653 | -0.197 |
| -1.625000000000072 | 0.907 | -0.644 | -0.195 |
| -1.620000000000072 | 0.899 | -0.634 | -0.192 |
| -1.615000000000072 | 0.891 | -0.625 | -0.19 |
| -1.610000000000072 | 0.883 | -0.615 | -0.188 |
| -1.605000000000072 | 0.875 | -0.606 | -0.186 |
| -1.600000000000072 | 0.867 | -0.597 | -0.184 |
| -1.595000000000073 | 0.859 | -0.588 | -0.182 |
| -1.590000000000073 | 0.85 | -0.58 | -0.18 |
| -1.585000000000073 | 0.842 | -0.571 | -0.178 |
| -1.580000000000073 | 0.834 | -0.563 | -0.177 |
| -1.575000000000073 | 0.825 | -0.555 | -0.175 |
| -1.570000000000073 | 0.817 | -0.547 | -0.173 |
| -1.565000000000073 | 0.809 | -0.539 | -0.171 |
| -1.560000000000073 | 0.8 | -0.531 | -0.169 |
| -1.555000000000073 | 0.792 | -0.523 | -0.167 |
| -1.550000000000074 | 0.783 | -0.515 | -0.165 |
| -1.545000000000074 | 0.774 | -0.508 | -0.164 |
| -1.540000000000074 | 0.766 | -0.501 | -0.162 |
| -1.535000000000074 | 0.757 | -0.493 | -0.16 |
| -1.530000000000074 | 0.748 | -0.486 | -0.158 |
| -1.525000000000074 | 0.74 | -0.479 | -0.156 |
| -1.520000000000074 | 0.731 | -0.472 | -0.155 |
| -1.515000000000074 | 0.722 | -0.466 | -0.153 |
| -1.510000000000074 | 0.713 | -0.459 | -0.151 |
| -1.505000000000074 | 0.704 | -0.452 | -0.15 |
| -1.500000000000075 | 0.695 | -0.446 | -0.148 |
| -1.495000000000075 | 0.686 | -0.44 | -0.146 |
| -1.490000000000075 | 0.677 | -0.433 | -0.145 |
| -1.485000000000075 | 0.668 | -0.427 | -0.143 |
| -1.480000000000075 | 0.659 | -0.421 | -0.141 |
| -1.475000000000075 | 0.65 | -0.415 | -0.14 |
| -1.470000000000075 | 0.64 | -0.409 | -0.138 |
| -1.465000000000075 | 0.631 | -0.403 | -0.137 |
| -1.460000000000075 | 0.622 | -0.397 | -0.135 |
| -1.455000000000076 | 0.612 | -0.392 | -0.134 |
| -1.450000000000076 | 0.603 | -0.386 | -0.132 |
| -1.445000000000076 | 0.593 | -0.381 | -0.13 |
| -1.440000000000076 | 0.584 | -0.375 | -0.129 |
| -1.435000000000076 | 0.574 | -0.37 | -0.127 |
| -1.430000000000076 | 0.564 | -0.365 | -0.126 |
| -1.425000000000076 | 0.554 | -0.359 | -0.125 |
| -1.420000000000076 | 0.544 | -0.354 | -0.123 |
| -1.415000000000076 | 0.534 | -0.349 | -0.122 |
| -1.410000000000077 | 0.524 | -0.344 | -0.12 |
| -1.405000000000077 | 0.514 | -0.339 | -0.119 |
| -1.400000000000077 | 0.504 | -0.335 | -0.117 |
| -1.395000000000077 | 0.494 | -0.33 | -0.116 |
| -1.390000000000077 | 0.484 | -0.325 | -0.115 |
| -1.385000000000077 | 0.473 | -0.32 | -0.113 |
| -1.380000000000077 | 0.463 | -0.316 | -0.112 |
| -1.375000000000077 | 0.452 | -0.311 | -0.111 |
| -1.370000000000077 | 0.441 | -0.307 | -0.109 |
| -1.365000000000077 | 0.431 | -0.303 | -0.108 |
| -1.360000000000078 | 0.42 | -0.298 | -0.107 |
| -1.355000000000078 | 0.409 | -0.294 | -0.105 |
| -1.350000000000078 | 0.398 | -0.29 | -0.104 |
| -1.345000000000078 | 0.387 | -0.286 | -0.103 |
| -1.340000000000078 | 0.376 | -0.281 | -0.102 |
| -1.335000000000078 | 0.364 | -0.277 | -0.1 |
| -1.330000000000078 | 0.353 | -0.273 | -0.099 |
| -1.325000000000078 | 0.341 | -0.27 | -0.098 |
| -1.320000000000078 | 0.329 | -0.266 | -0.097 |
| -1.315000000000079 | 0.318 | -0.262 | -0.095 |
| -1.310000000000079 | 0.306 | -0.258 | -0.094 |
| -1.305000000000079 | 0.294 | -0.254 | -0.093 |
| -1.300000000000079 | 0.282 | -0.251 | -0.092 |
| -1.295000000000079 | 0.269 | -0.247 | -0.091 |
| -1.29000000000008 | 0.257 | -0.243 | -0.09 |
| -1.285000000000079 | 0.244 | -0.24 | -0.089 |
| -1.280000000000079 | 0.231 | -0.236 | -0.087 |
| -1.275000000000079 | 0.219 | -0.233 | -0.086 |
| -1.270000000000079 | 0.205 | -0.23 | -0.085 |
| -1.26500000000008 | 0.192 | -0.226 | -0.084 |
| -1.26000000000008 | 0.179 | -0.223 | -0.083 |
| -1.25500000000008 | 0.165 | -0.22 | -0.082 |
| -1.25000000000008 | 0.151 | -0.216 | -0.081 |
| -1.24500000000008 | 0.137 | -0.213 | -0.08 |
| -1.24000000000008 | 0.123 | -0.21 | -0.079 |
| -1.23500000000008 | 0.109 | -0.207 | -0.078 |
| -1.23000000000008 | 0.094 | -0.204 | -0.077 |
| -1.22500000000008 | 0.079 | -0.201 | -0.076 |
| -1.220000000000081 | 0.064 | -0.198 | -0.075 |
| -1.215000000000081 | 0.049 | -0.195 | -0.074 |
| -1.210000000000081 | 0.033 | -0.192 | -0.073 |
| -1.205000000000081 | 0.017 | -0.189 | -0.072 |
| -1.200000000000081 | 0.001 | -0.186 | -0.071 |
| -1.195000000000081 | -0.015 | -0.184 | -0.07 |
| -1.190000000000081 | -0.032 | -0.181 | -0.069 |
| -1.185000000000081 | -0.05 | -0.178 | -0.068 |
| -1.180000000000081 | -0.067 | -0.175 | -0.067 |
| -1.175000000000082 | -0.085 | -0.173 | -0.066 |
| -1.170000000000082 | -0.103 | -0.17 | -0.065 |
| -1.165000000000082 | -0.122 | -0.167 | -0.065 |
| -1.160000000000082 | -0.141 | -0.165 | -0.064 |
| -1.155000000000082 | -0.161 | -0.162 | -0.063 |
| -1.150000000000082 | -0.181 | -0.16 | -0.062 |
| -1.145000000000082 | -0.202 | -0.157 | -0.061 |
| -1.140000000000082 | -0.223 | -0.155 | -0.06 |
| -1.135000000000082 | -0.245 | -0.153 | -0.059 |
| -1.130000000000082 | -0.268 | -0.15 | -0.059 |
| -1.125000000000083 | -0.292 | -0.148 | -0.058 |
| -1.120000000000083 | -0.316 | -0.146 | -0.057 |
| -1.115000000000083 | -0.341 | -0.143 | -0.056 |
| -1.110000000000083 | -0.367 | -0.141 | -0.055 |
| -1.105000000000083 | -0.394 | -0.139 | -0.054 |
| -1.100000000000083 | -0.422 | -0.137 | -0.054 |
| -1.095000000000083 | -0.452 | -0.135 | -0.053 |
| -1.090000000000083 | -0.483 | -0.132 | -0.052 |
| -1.085000000000083 | -0.515 | -0.13 | -0.051 |
| -1.080000000000084 | -0.549 | -0.128 | -0.051 |
| -1.075000000000084 | -0.585 | -0.126 | -0.05 |
| -1.070000000000084 | -0.623 | -0.124 | -0.049 |
| -1.065000000000084 | -0.664 | -0.122 | -0.048 |
| -1.060000000000084 | -0.708 | -0.12 | -0.048 |
| -1.055000000000084 | -0.755 | -0.118 | -0.047 |
| -1.050000000000084 | -0.807 | -0.116 | -0.046 |
| -1.045000000000084 | -0.863 | -0.115 | -0.046 |
| -1.040000000000084 | -0.926 | -0.113 | -0.045 |
| -1.035000000000085 | -0.996 | -0.111 | -0.044 |
| -1.030000000000085 | -1.077 | -0.109 | -0.044 |
| -1.025000000000085 | -1.172 | -0.107 | -0.043 |
| -1.020000000000085 | -1.288 | -0.105 | -0.042 |
| -1.015000000000085 | -1.435 | -0.104 | -0.042 |
| -1.010000000000085 | -1.642 | -0.102 | -0.041 |
| -1.005000000000085 | -1.992 | -0.1 | -0.04 |
| -1.000000000000085 | -14.393 | -0.099 | -0.04 |
| -0.995000000000085 | -1.999 | -0.097 | -0.039 |
| -0.990000000000085 | -1.657 | -0.095 | -0.038 |
| -0.985000000000085 | -1.458 | -0.094 | -0.038 |
| -0.980000000000085 | -1.318 | -0.092 | -0.037 |
| -0.975000000000085 | -1.21 | -0.091 | -0.037 |
| -0.970000000000085 | -1.122 | -0.089 | -0.036 |
| -0.965000000000085 | -1.049 | -0.087 | -0.036 |
| -0.960000000000085 | -0.986 | -0.086 | -0.035 |
| -0.955000000000085 | -0.931 | -0.084 | -0.034 |
| -0.950000000000085 | -0.882 | -0.083 | -0.034 |
| -0.945000000000085 | -0.838 | -0.082 | -0.033 |
| -0.940000000000085 | -0.798 | -0.08 | -0.033 |
| -0.935000000000085 | -0.762 | -0.079 | -0.032 |
| -0.930000000000085 | -0.728 | -0.077 | -0.032 |
| -0.925000000000085 | -0.698 | -0.076 | -0.031 |
| -0.920000000000085 | -0.669 | -0.075 | -0.031 |
| -0.915000000000085 | -0.642 | -0.073 | -0.03 |
| -0.910000000000085 | -0.618 | -0.072 | -0.03 |
| -0.905000000000085 | -0.594 | -0.071 | -0.029 |
| -0.900000000000085 | -0.572 | -0.069 | -0.029 |
| -0.895000000000085 | -0.552 | -0.068 | -0.028 |
| -0.890000000000085 | -0.532 | -0.067 | -0.028 |
| -0.885000000000085 | -0.513 | -0.066 | -0.027 |
| -0.880000000000085 | -0.496 | -0.064 | -0.027 |
| -0.875000000000085 | -0.479 | -0.063 | -0.026 |
| -0.870000000000085 | -0.463 | -0.062 | -0.026 |
| -0.865000000000085 | -0.448 | -0.061 | -0.025 |
| -0.860000000000085 | -0.433 | -0.06 | -0.025 |
| -0.855000000000085 | -0.419 | -0.059 | -0.024 |
| -0.850000000000085 | -0.406 | -0.058 | -0.024 |
| -0.845000000000085 | -0.393 | -0.056 | -0.023 |
| -0.840000000000085 | -0.381 | -0.055 | -0.023 |
| -0.835000000000085 | -0.369 | -0.054 | -0.023 |
| -0.830000000000085 | -0.358 | -0.053 | -0.022 |
| -0.825000000000085 | -0.347 | -0.052 | -0.022 |
| -0.820000000000085 | -0.337 | -0.051 | -0.021 |
| -0.815000000000085 | -0.327 | -0.05 | -0.021 |
| -0.810000000000085 | -0.317 | -0.049 | -0.021 |
| -0.805000000000085 | -0.308 | -0.048 | -0.02 |
| -0.800000000000085 | -0.299 | -0.047 | -0.02 |
| -0.795000000000085 | -0.29 | -0.046 | -0.019 |
| -0.790000000000085 | -0.281 | -0.045 | -0.019 |
| -0.785000000000085 | -0.273 | -0.045 | -0.019 |
| -0.780000000000085 | -0.265 | -0.044 | -0.018 |
| -0.775000000000085 | -0.258 | -0.043 | -0.018 |
| -0.770000000000085 | -0.25 | -0.042 | -0.018 |
| -0.765000000000085 | -0.243 | -0.041 | -0.017 |
| -0.760000000000085 | -0.236 | -0.04 | -0.017 |
| -0.755000000000085 | -0.229 | -0.039 | -0.017 |
| -0.750000000000085 | -0.223 | -0.038 | -0.016 |
| -0.745000000000085 | -0.217 | -0.038 | -0.016 |
| -0.740000000000085 | -0.21 | -0.037 | -0.016 |
| -0.735000000000085 | -0.205 | -0.036 | -0.015 |
| -0.730000000000085 | -0.199 | -0.035 | -0.015 |
| -0.725000000000085 | -0.193 | -0.035 | -0.015 |
| -0.720000000000085 | -0.188 | -0.034 | -0.014 |
| -0.715000000000085 | -0.182 | -0.033 | -0.014 |
| -0.710000000000085 | -0.177 | -0.032 | -0.014 |
| -0.705000000000085 | -0.172 | -0.032 | -0.013 |
| -0.700000000000085 | -0.167 | -0.031 | -0.013 |
| -0.695000000000085 | -0.163 | -0.03 | -0.013 |
| -0.690000000000085 | -0.158 | -0.03 | -0.013 |
| -0.685000000000085 | -0.153 | -0.029 | -0.012 |
| -0.680000000000085 | -0.149 | -0.028 | -0.012 |
| -0.675000000000085 | -0.145 | -0.028 | -0.012 |
| -0.670000000000085 | -0.141 | -0.027 | -0.011 |
| -0.665000000000085 | -0.137 | -0.026 | -0.011 |
| -0.660000000000085 | -0.133 | -0.026 | -0.011 |
| -0.655000000000085 | -0.129 | -0.025 | -0.011 |
| -0.650000000000085 | -0.125 | -0.024 | -0.01 |
| -0.645000000000085 | -0.122 | -0.024 | -0.01 |
| -0.640000000000085 | -0.118 | -0.023 | -0.01 |
| -0.635000000000085 | -0.115 | -0.023 | -0.01 |
| -0.630000000000085 | -0.111 | -0.022 | -0.01 |
| -0.625000000000085 | -0.108 | -0.022 | -0.009 |
| -0.620000000000085 | -0.105 | -0.021 | -0.009 |
| -0.615000000000085 | -0.102 | -0.021 | -0.009 |
| -0.610000000000085 | -0.099 | -0.02 | -0.009 |
| -0.605000000000085 | -0.096 | -0.02 | -0.008 |
| -0.600000000000085 | -0.093 | -0.019 | -0.008 |
| -0.595000000000085 | -0.09 | -0.019 | -0.008 |
| -0.590000000000085 | -0.088 | -0.018 | -0.008 |
| -0.585000000000085 | -0.085 | -0.018 | -0.008 |
| -0.580000000000085 | -0.082 | -0.017 | -0.007 |
| -0.575000000000085 | -0.08 | -0.017 | -0.007 |
| -0.570000000000085 | -0.078 | -0.016 | -0.007 |
| -0.565000000000085 | -0.075 | -0.016 | -0.007 |
| -0.560000000000085 | -0.073 | -0.015 | -0.007 |
| -0.555000000000085 | -0.071 | -0.015 | -0.006 |
| -0.550000000000085 | -0.068 | -0.015 | -0.006 |
| -0.545000000000085 | -0.066 | -0.014 | -0.006 |
| -0.540000000000085 | -0.064 | -0.014 | -0.006 |
| -0.535000000000085 | -0.062 | -0.013 | -0.006 |
| -0.530000000000085 | -0.06 | -0.013 | -0.006 |
| -0.525000000000085 | -0.058 | -0.013 | -0.005 |
| -0.520000000000085 | -0.056 | -0.012 | -0.005 |
| -0.515000000000085 | -0.055 | -0.012 | -0.005 |
| -0.510000000000085 | -0.053 | -0.012 | -0.005 |
| -0.505000000000085 | -0.051 | -0.011 | -0.005 |
| -0.500000000000085 | -0.049 | -0.011 | -0.005 |
| -0.495000000000085 | -0.048 | -0.01 | -0.005 |
| -0.490000000000085 | -0.046 | -0.01 | -0.004 |
| -0.485000000000085 | -0.045 | -0.01 | -0.004 |
| -0.480000000000085 | -0.043 | -0.01 | -0.004 |
| -0.475000000000085 | -0.042 | -0.009 | -0.004 |
| -0.470000000000085 | -0.04 | -0.009 | -0.004 |
| -0.465000000000085 | -0.039 | -0.009 | -0.004 |
| -0.460000000000085 | -0.037 | -0.008 | -0.004 |
| -0.455000000000085 | -0.036 | -0.008 | -0.004 |
| -0.450000000000085 | -0.035 | -0.008 | -0.003 |
| -0.445000000000085 | -0.033 | -0.008 | -0.003 |
| -0.440000000000085 | -0.032 | -0.007 | -0.003 |
| -0.435000000000085 | -0.031 | -0.007 | -0.003 |
| -0.430000000000085 | -0.03 | -0.007 | -0.003 |
| -0.425000000000085 | -0.029 | -0.007 | -0.003 |
| -0.420000000000085 | -0.028 | -0.006 | -0.003 |
| -0.415000000000085 | -0.027 | -0.006 | -0.003 |
| -0.410000000000085 | -0.026 | -0.006 | -0.003 |
| -0.405000000000085 | -0.025 | -0.006 | -0.002 |
| -0.400000000000085 | -0.024 | -0.005 | -0.002 |
| -0.395000000000085 | -0.023 | -0.005 | -0.002 |
| -0.390000000000085 | -0.022 | -0.005 | -0.002 |
| -0.385000000000085 | -0.021 | -0.005 | -0.002 |
| -0.380000000000085 | -0.02 | -0.005 | -0.002 |
| -0.375000000000085 | -0.019 | -0.004 | -0.002 |
| -0.370000000000085 | -0.018 | -0.004 | -0.002 |
| -0.365000000000085 | -0.018 | -0.004 | -0.002 |
| -0.360000000000085 | -0.017 | -0.004 | -0.002 |
| -0.355000000000085 | -0.016 | -0.004 | -0.002 |
| -0.350000000000085 | -0.015 | -0.004 | -0.002 |
| -0.345000000000085 | -0.015 | -0.003 | -0.002 |
| -0.340000000000085 | -0.014 | -0.003 | -0.001 |
| -0.335000000000085 | -0.013 | -0.003 | -0.001 |
| -0.330000000000085 | -0.013 | -0.003 | -0.001 |
| -0.325000000000085 | -0.012 | -0.003 | -0.001 |
| -0.320000000000085 | -0.012 | -0.003 | -0.001 |
| -0.315000000000085 | -0.011 | -0.003 | -0.001 |
| -0.310000000000085 | -0.011 | -0.003 | -0.001 |
| -0.305000000000085 | -0.01 | -0.002 | -0.001 |
| -0.300000000000085 | -0.01 | -0.002 | -0.001 |
| -0.295000000000085 | -0.009 | -0.002 | -0.001 |
| -0.290000000000085 | -0.009 | -0.002 | -0.001 |
| -0.285000000000085 | -0.008 | -0.002 | -0.001 |
| -0.280000000000085 | -0.008 | -0.002 | -0.001 |
| -0.275000000000085 | -0.007 | -0.002 | -0.001 |
| -0.270000000000085 | -0.007 | -0.002 | -0.001 |
| -0.265000000000085 | -0.006 | -0.002 | -0.001 |
| -0.260000000000085 | -0.006 | -0.001 | -0.001 |
| -0.255000000000085 | -0.006 | -0.001 | -0.001 |
| -0.250000000000085 | -0.005 | -0.001 | -0.001 |
| -0.245000000000085 | -0.005 | -0.001 | -0.001 |
| -0.240000000000085 | -0.005 | -0.001 | -0.001 |
| -0.235000000000085 | -0.004 | -0.001 | 0 |
| -0.230000000000085 | -0.004 | -0.001 | 0 |
| -0.225000000000085 | -0.004 | -0.001 | 0 |
| -0.220000000000085 | -0.004 | -0.001 | 0 |
| -0.215000000000085 | -0.003 | -0.001 | 0 |
| -0.210000000000085 | -0.003 | -0.001 | 0 |
| -0.205000000000085 | -0.003 | -0.001 | 0 |
| -0.200000000000085 | -0.003 | -0.001 | 0 |
| -0.195000000000085 | -0.003 | -0.001 | 0 |
| -0.190000000000085 | -0.002 | -0.001 | 0 |
| -0.185000000000085 | -0.002 | -0.001 | 0 |
| -0.180000000000085 | -0.002 | 0 | 0 |
| -0.175000000000085 | -0.002 | 0 | 0 |
| -0.170000000000085 | -0.002 | 0 | 0 |
| -0.165000000000085 | -0.002 | 0 | 0 |
| -0.160000000000085 | -0.001 | 0 | 0 |
| -0.155000000000084 | -0.001 | 0 | 0 |
| -0.150000000000084 | -0.001 | 0 | 0 |
| -0.145000000000084 | -0.001 | 0 | 0 |
| -0.140000000000084 | -0.001 | 0 | 0 |
| -0.135000000000084 | -0.001 | 0 | 0 |
| -0.130000000000084 | -0.001 | 0 | 0 |
| -0.125000000000084 | -0.001 | 0 | 0 |
| -0.120000000000084 | -0.001 | 0 | 0 |
| -0.115000000000084 | -0.001 | 0 | 0 |
| -0.110000000000084 | 0 | 0 | 0 |
| -0.105000000000084 | 0 | 0 | 0 |
| -0.100000000000084 | 0 | 0 | 0 |
| -0.0950000000000844 | 0 | 0 | 0 |
| -0.0900000000000844 | 0 | 0 | 0 |
| -0.0850000000000844 | 0 | 0 | 0 |
| -0.0800000000000844 | 0 | 0 | 0 |
| -0.0750000000000844 | 0 | 0 | 0 |
| -0.0700000000000844 | 0 | 0 | 0 |
| -0.0650000000000844 | 0 | 0 | 0 |
| -0.0600000000000844 | 0 | 0 | 0 |
| -0.0550000000000844 | 0 | 0 | 0 |
| -0.0500000000000844 | 0 | 0 | 0 |
| -0.0450000000000844 | 0 | 0 | 0 |
| -0.0400000000000844 | 0 | 0 | 0 |
| -0.0350000000000844 | 0 | 0 | 0 |
| -0.0300000000000844 | 0 | 0 | 0 |
| -0.0250000000000844 | 0 | 0 | 0 |
| -0.0200000000000844 | 0 | 0 | 0 |
| -0.0150000000000844 | 0 | 0 | 0 |
| -0.0100000000000844 | 0 | 0 | 0 |
| -0.00500000000008444 | 0 | 0 | 0 |
| -8.4444604087075e-14 | 0 | 0 | 0 |
| 0.00499999999991555 | 0 | 0 | 0 |
| 0.00999999999991555 | 0 | 0 | 0 |
| 0.0149999999999156 | 0 | 0 | 0 |
| 0.0199999999999156 | 0 | 0 | 0 |
| 0.0249999999999156 | 0 | 0 | 0 |
| 0.0299999999999156 | 0 | 0 | 0 |
| 0.0349999999999155 | 0 | 0 | 0 |
| 0.0399999999999155 | 0 | 0 | 0 |
| 0.0449999999999155 | 0 | 0 | 0 |
| 0.0499999999999155 | 0 | 0 | 0 |
| 0.0549999999999155 | 0 | 0 | 0 |
| 0.0599999999999155 | 0 | 0 | 0 |
| 0.0649999999999155 | 0 | 0 | 0 |
| 0.0699999999999155 | 0 | 0 | 0 |
| 0.0749999999999155 | 0 | 0 | 0 |
| 0.0799999999999155 | 0 | 0 | 0 |
| 0.0849999999999155 | 0 | 0 | 0 |
| 0.0899999999999155 | 0 | 0 | 0 |
| 0.0949999999999155 | 0 | 0 | 0 |
| 0.0999999999999155 | 0 | 0 | 0 |
| 0.104999999999916 | 0 | 0 | 0 |
| 0.109999999999916 | 0 | 0 | 0 |
| 0.114999999999916 | 0.001 | 0 | 0 |
| 0.119999999999916 | 0.001 | 0 | 0 |
| 0.124999999999916 | 0.001 | 0 | 0 |
| 0.129999999999916 | 0.001 | 0 | 0 |
| 0.134999999999916 | 0.001 | 0 | 0 |
| 0.139999999999916 | 0.001 | 0 | 0 |
| 0.144999999999916 | 0.001 | 0 | 0 |
| 0.149999999999916 | 0.001 | 0 | 0 |
| 0.154999999999916 | 0.001 | 0 | 0 |
| 0.159999999999916 | 0.001 | 0 | 0 |
| 0.164999999999916 | 0.002 | 0 | 0 |
| 0.169999999999916 | 0.002 | 0 | 0 |
| 0.174999999999916 | 0.002 | 0 | 0 |
| 0.179999999999916 | 0.002 | 0 | 0 |
| 0.184999999999916 | 0.002 | 0.001 | 0 |
| 0.189999999999916 | 0.002 | 0.001 | 0 |
| 0.194999999999916 | 0.003 | 0.001 | 0 |
| 0.199999999999916 | 0.003 | 0.001 | 0 |
| 0.204999999999916 | 0.003 | 0.001 | 0 |
| 0.209999999999916 | 0.003 | 0.001 | 0 |
| 0.214999999999916 | 0.003 | 0.001 | 0 |
| 0.219999999999916 | 0.004 | 0.001 | 0 |
| 0.224999999999916 | 0.004 | 0.001 | 0 |
| 0.229999999999916 | 0.004 | 0.001 | 0 |
| 0.234999999999916 | 0.004 | 0.001 | 0 |
| 0.239999999999916 | 0.005 | 0.001 | 0.001 |
| 0.244999999999916 | 0.005 | 0.001 | 0.001 |
| 0.249999999999916 | 0.005 | 0.001 | 0.001 |
| 0.254999999999916 | 0.006 | 0.001 | 0.001 |
| 0.259999999999916 | 0.006 | 0.001 | 0.001 |
| 0.264999999999916 | 0.006 | 0.002 | 0.001 |
| 0.269999999999916 | 0.007 | 0.002 | 0.001 |
| 0.274999999999916 | 0.007 | 0.002 | 0.001 |
| 0.279999999999916 | 0.008 | 0.002 | 0.001 |
| 0.284999999999916 | 0.008 | 0.002 | 0.001 |
| 0.289999999999916 | 0.009 | 0.002 | 0.001 |
| 0.294999999999916 | 0.009 | 0.002 | 0.001 |
| 0.299999999999916 | 0.01 | 0.002 | 0.001 |
| 0.304999999999916 | 0.01 | 0.002 | 0.001 |
| 0.309999999999916 | 0.011 | 0.003 | 0.001 |
| 0.314999999999916 | 0.011 | 0.003 | 0.001 |
| 0.319999999999916 | 0.012 | 0.003 | 0.001 |
| 0.324999999999916 | 0.012 | 0.003 | 0.001 |
| 0.329999999999916 | 0.013 | 0.003 | 0.001 |
| 0.334999999999916 | 0.013 | 0.003 | 0.001 |
| 0.339999999999916 | 0.014 | 0.003 | 0.001 |
| 0.344999999999916 | 0.015 | 0.003 | 0.002 |
| 0.349999999999916 | 0.015 | 0.004 | 0.002 |
| 0.354999999999916 | 0.016 | 0.004 | 0.002 |
| 0.359999999999916 | 0.017 | 0.004 | 0.002 |
| 0.364999999999916 | 0.018 | 0.004 | 0.002 |
| 0.369999999999916 | 0.018 | 0.004 | 0.002 |
| 0.374999999999916 | 0.019 | 0.004 | 0.002 |
| 0.379999999999916 | 0.02 | 0.005 | 0.002 |
| 0.384999999999916 | 0.021 | 0.005 | 0.002 |
| 0.389999999999916 | 0.022 | 0.005 | 0.002 |
| 0.394999999999916 | 0.023 | 0.005 | 0.002 |
| 0.399999999999916 | 0.024 | 0.005 | 0.002 |
| 0.404999999999916 | 0.025 | 0.006 | 0.002 |
| 0.409999999999916 | 0.026 | 0.006 | 0.003 |
| 0.414999999999916 | 0.027 | 0.006 | 0.003 |
| 0.419999999999916 | 0.028 | 0.006 | 0.003 |
| 0.424999999999916 | 0.029 | 0.007 | 0.003 |
| 0.429999999999916 | 0.03 | 0.007 | 0.003 |
| 0.434999999999916 | 0.031 | 0.007 | 0.003 |
| 0.439999999999916 | 0.032 | 0.007 | 0.003 |
| 0.444999999999916 | 0.033 | 0.008 | 0.003 |
| 0.449999999999916 | 0.035 | 0.008 | 0.003 |
| 0.454999999999916 | 0.036 | 0.008 | 0.004 |
| 0.459999999999916 | 0.037 | 0.008 | 0.004 |
| 0.464999999999916 | 0.039 | 0.009 | 0.004 |
| 0.469999999999916 | 0.04 | 0.009 | 0.004 |
| 0.474999999999916 | 0.042 | 0.009 | 0.004 |
| 0.479999999999916 | 0.043 | 0.01 | 0.004 |
| 0.484999999999916 | 0.045 | 0.01 | 0.004 |
| 0.489999999999916 | 0.046 | 0.01 | 0.004 |
| 0.494999999999916 | 0.048 | 0.01 | 0.005 |
| 0.499999999999916 | 0.049 | 0.011 | 0.005 |
| 0.504999999999916 | 0.051 | 0.011 | 0.005 |
| 0.509999999999916 | 0.053 | 0.012 | 0.005 |
| 0.514999999999916 | 0.055 | 0.012 | 0.005 |
| 0.519999999999916 | 0.056 | 0.012 | 0.005 |
| 0.524999999999916 | 0.058 | 0.013 | 0.005 |
| 0.529999999999916 | 0.06 | 0.013 | 0.006 |
| 0.534999999999916 | 0.062 | 0.013 | 0.006 |
| 0.539999999999916 | 0.064 | 0.014 | 0.006 |
| 0.544999999999916 | 0.066 | 0.014 | 0.006 |
| 0.549999999999916 | 0.068 | 0.015 | 0.006 |
| 0.554999999999916 | 0.071 | 0.015 | 0.006 |
| 0.559999999999916 | 0.073 | 0.015 | 0.007 |
| 0.564999999999916 | 0.075 | 0.016 | 0.007 |
| 0.569999999999916 | 0.078 | 0.016 | 0.007 |
| 0.574999999999916 | 0.08 | 0.017 | 0.007 |
| 0.579999999999916 | 0.082 | 0.017 | 0.007 |
| 0.584999999999916 | 0.085 | 0.018 | 0.008 |
| 0.589999999999916 | 0.088 | 0.018 | 0.008 |
| 0.594999999999916 | 0.09 | 0.019 | 0.008 |
| 0.599999999999916 | 0.093 | 0.019 | 0.008 |
| 0.604999999999916 | 0.096 | 0.02 | 0.008 |
| 0.609999999999916 | 0.099 | 0.02 | 0.009 |
| 0.614999999999916 | 0.102 | 0.021 | 0.009 |
| 0.619999999999916 | 0.105 | 0.021 | 0.009 |
| 0.624999999999916 | 0.108 | 0.022 | 0.009 |
| 0.629999999999916 | 0.111 | 0.022 | 0.01 |
| 0.634999999999916 | 0.115 | 0.023 | 0.01 |
| 0.639999999999916 | 0.118 | 0.023 | 0.01 |
| 0.644999999999916 | 0.122 | 0.024 | 0.01 |
| 0.649999999999916 | 0.125 | 0.024 | 0.01 |
| 0.654999999999916 | 0.129 | 0.025 | 0.011 |
| 0.659999999999916 | 0.133 | 0.026 | 0.011 |
| 0.664999999999916 | 0.137 | 0.026 | 0.011 |
| 0.669999999999916 | 0.141 | 0.027 | 0.011 |
| 0.674999999999916 | 0.145 | 0.028 | 0.012 |
| 0.679999999999916 | 0.149 | 0.028 | 0.012 |
| 0.684999999999916 | 0.153 | 0.029 | 0.012 |
| 0.689999999999916 | 0.158 | 0.03 | 0.013 |
| 0.694999999999916 | 0.163 | 0.03 | 0.013 |
| 0.699999999999916 | 0.167 | 0.031 | 0.013 |
| 0.704999999999916 | 0.172 | 0.032 | 0.013 |
| 0.709999999999916 | 0.177 | 0.032 | 0.014 |
| 0.714999999999916 | 0.182 | 0.033 | 0.014 |
| 0.719999999999916 | 0.188 | 0.034 | 0.014 |
| 0.724999999999916 | 0.193 | 0.035 | 0.015 |
| 0.729999999999916 | 0.199 | 0.035 | 0.015 |
| 0.734999999999916 | 0.205 | 0.036 | 0.015 |
| 0.739999999999916 | 0.21 | 0.037 | 0.016 |
| 0.744999999999916 | 0.217 | 0.038 | 0.016 |
| 0.749999999999916 | 0.223 | 0.038 | 0.016 |
| 0.754999999999916 | 0.229 | 0.039 | 0.017 |
| 0.759999999999916 | 0.236 | 0.04 | 0.017 |
| 0.764999999999916 | 0.243 | 0.041 | 0.017 |
| 0.769999999999916 | 0.25 | 0.042 | 0.018 |
| 0.774999999999916 | 0.258 | 0.043 | 0.018 |
| 0.779999999999916 | 0.265 | 0.044 | 0.018 |
| 0.784999999999916 | 0.273 | 0.045 | 0.019 |
| 0.789999999999916 | 0.281 | 0.045 | 0.019 |
| 0.794999999999916 | 0.29 | 0.046 | 0.019 |
| 0.799999999999916 | 0.299 | 0.047 | 0.02 |
| 0.804999999999916 | 0.308 | 0.048 | 0.02 |
| 0.809999999999916 | 0.317 | 0.049 | 0.021 |
| 0.814999999999916 | 0.327 | 0.05 | 0.021 |
| 0.819999999999916 | 0.337 | 0.051 | 0.021 |
| 0.824999999999916 | 0.347 | 0.052 | 0.022 |
| 0.829999999999916 | 0.358 | 0.053 | 0.022 |
| 0.834999999999916 | 0.369 | 0.054 | 0.023 |
| 0.839999999999916 | 0.381 | 0.055 | 0.023 |
| 0.844999999999916 | 0.393 | 0.056 | 0.023 |
| 0.849999999999916 | 0.406 | 0.058 | 0.024 |
| 0.854999999999916 | 0.419 | 0.059 | 0.024 |
| 0.859999999999916 | 0.433 | 0.06 | 0.025 |
| 0.864999999999916 | 0.448 | 0.061 | 0.025 |
| 0.869999999999916 | 0.463 | 0.062 | 0.026 |
| 0.874999999999916 | 0.479 | 0.063 | 0.026 |
| 0.879999999999916 | 0.496 | 0.064 | 0.027 |
| 0.884999999999916 | 0.513 | 0.066 | 0.027 |
| 0.889999999999916 | 0.532 | 0.067 | 0.028 |
| 0.894999999999916 | 0.552 | 0.068 | 0.028 |
| 0.899999999999916 | 0.572 | 0.069 | 0.029 |
| 0.904999999999916 | 0.594 | 0.071 | 0.029 |
| 0.909999999999916 | 0.618 | 0.072 | 0.03 |
| 0.914999999999916 | 0.642 | 0.073 | 0.03 |
| 0.919999999999916 | 0.669 | 0.075 | 0.031 |
| 0.924999999999916 | 0.698 | 0.076 | 0.031 |
| 0.929999999999916 | 0.728 | 0.077 | 0.032 |
| 0.934999999999916 | 0.762 | 0.079 | 0.032 |
| 0.939999999999916 | 0.798 | 0.08 | 0.033 |
| 0.944999999999916 | 0.838 | 0.082 | 0.033 |
| 0.949999999999916 | 0.882 | 0.083 | 0.034 |
| 0.954999999999916 | 0.931 | 0.084 | 0.034 |
| 0.959999999999916 | 0.986 | 0.086 | 0.035 |
| 0.964999999999916 | 1.049 | 0.087 | 0.036 |
| 0.969999999999916 | 1.122 | 0.089 | 0.036 |
| 0.974999999999916 | 1.21 | 0.091 | 0.037 |
| 0.979999999999916 | 1.318 | 0.092 | 0.037 |
| 0.984999999999916 | 1.458 | 0.094 | 0.038 |
| 0.989999999999916 | 1.657 | 0.095 | 0.038 |
| 0.994999999999916 | 1.999 | 0.097 | 0.039 |
| 0.999999999999916 | 14.402 | 0.099 | 0.04 |
| 1.004999999999916 | 1.992 | 0.1 | 0.04 |
| 1.009999999999916 | 1.642 | 0.102 | 0.041 |
| 1.014999999999916 | 1.435 | 0.104 | 0.042 |
| 1.019999999999916 | 1.288 | 0.105 | 0.042 |
| 1.024999999999916 | 1.172 | 0.107 | 0.043 |
| 1.029999999999916 | 1.077 | 0.109 | 0.044 |
| 1.034999999999916 | 0.996 | 0.111 | 0.044 |
| 1.039999999999915 | 0.926 | 0.113 | 0.045 |
| 1.044999999999915 | 0.863 | 0.115 | 0.046 |
| 1.049999999999915 | 0.807 | 0.116 | 0.046 |
| 1.054999999999915 | 0.755 | 0.118 | 0.047 |
| 1.059999999999915 | 0.708 | 0.12 | 0.048 |
| 1.064999999999915 | 0.664 | 0.122 | 0.048 |
| 1.069999999999915 | 0.623 | 0.124 | 0.049 |
| 1.074999999999915 | 0.585 | 0.126 | 0.05 |
| 1.079999999999915 | 0.549 | 0.128 | 0.051 |
| 1.084999999999914 | 0.515 | 0.13 | 0.051 |
| 1.089999999999914 | 0.483 | 0.132 | 0.052 |
| 1.094999999999914 | 0.452 | 0.135 | 0.053 |
| 1.099999999999914 | 0.422 | 0.137 | 0.054 |
| 1.104999999999914 | 0.394 | 0.139 | 0.054 |
| 1.109999999999914 | 0.367 | 0.141 | 0.055 |
| 1.114999999999914 | 0.341 | 0.143 | 0.056 |
| 1.119999999999914 | 0.316 | 0.146 | 0.057 |
| 1.124999999999914 | 0.292 | 0.148 | 0.058 |
| 1.129999999999914 | 0.268 | 0.15 | 0.059 |
| 1.134999999999913 | 0.245 | 0.153 | 0.059 |
| 1.139999999999913 | 0.223 | 0.155 | 0.06 |
| 1.144999999999913 | 0.202 | 0.157 | 0.061 |
| 1.149999999999913 | 0.181 | 0.16 | 0.062 |
| 1.154999999999913 | 0.161 | 0.162 | 0.063 |
| 1.159999999999913 | 0.141 | 0.165 | 0.064 |
| 1.164999999999913 | 0.122 | 0.167 | 0.065 |
| 1.169999999999913 | 0.103 | 0.17 | 0.065 |
| 1.174999999999913 | 0.085 | 0.173 | 0.066 |
| 1.179999999999912 | 0.067 | 0.175 | 0.067 |
| 1.184999999999912 | 0.05 | 0.178 | 0.068 |
| 1.189999999999912 | 0.032 | 0.181 | 0.069 |
| 1.194999999999912 | 0.015 | 0.184 | 0.07 |
| 1.199999999999912 | -0.001 | 0.186 | 0.071 |
| 1.204999999999912 | -0.017 | 0.189 | 0.072 |
| 1.209999999999912 | -0.033 | 0.192 | 0.073 |
| 1.214999999999912 | -0.049 | 0.195 | 0.074 |
| 1.219999999999912 | -0.064 | 0.198 | 0.075 |
| 1.224999999999911 | -0.079 | 0.201 | 0.076 |
| 1.229999999999911 | -0.094 | 0.204 | 0.077 |
| 1.234999999999911 | -0.109 | 0.207 | 0.078 |
| 1.239999999999911 | -0.123 | 0.21 | 0.079 |
| 1.244999999999911 | -0.137 | 0.213 | 0.08 |
| 1.249999999999911 | -0.151 | 0.216 | 0.081 |
| 1.254999999999911 | -0.165 | 0.22 | 0.082 |
| 1.259999999999911 | -0.179 | 0.223 | 0.083 |
| 1.264999999999911 | -0.192 | 0.226 | 0.084 |
| 1.269999999999911 | -0.205 | 0.23 | 0.085 |
| 1.27499999999991 | -0.219 | 0.233 | 0.086 |
| 1.27999999999991 | -0.231 | 0.236 | 0.087 |
| 1.28499999999991 | -0.244 | 0.24 | 0.089 |
| 1.28999999999991 | -0.257 | 0.243 | 0.09 |
| 1.29499999999991 | -0.269 | 0.247 | 0.091 |
| 1.29999999999991 | -0.282 | 0.251 | 0.092 |
| 1.30499999999991 | -0.294 | 0.254 | 0.093 |
| 1.30999999999991 | -0.306 | 0.258 | 0.094 |
| 1.31499999999991 | -0.318 | 0.262 | 0.095 |
| 1.319999999999909 | -0.329 | 0.266 | 0.097 |
| 1.324999999999909 | -0.341 | 0.27 | 0.098 |
| 1.329999999999909 | -0.353 | 0.273 | 0.099 |
| 1.334999999999909 | -0.364 | 0.277 | 0.1 |
| 1.339999999999909 | -0.376 | 0.281 | 0.102 |
| 1.344999999999909 | -0.387 | 0.286 | 0.103 |
| 1.349999999999909 | -0.398 | 0.29 | 0.104 |
| 1.354999999999909 | -0.409 | 0.294 | 0.105 |
| 1.359999999999909 | -0.42 | 0.298 | 0.107 |
| 1.364999999999908 | -0.431 | 0.303 | 0.108 |
| 1.369999999999908 | -0.441 | 0.307 | 0.109 |
| 1.374999999999908 | -0.452 | 0.311 | 0.111 |
| 1.379999999999908 | -0.463 | 0.316 | 0.112 |
| 1.384999999999908 | -0.473 | 0.32 | 0.113 |
| 1.389999999999908 | -0.484 | 0.325 | 0.115 |
| 1.394999999999908 | -0.494 | 0.33 | 0.116 |
| 1.399999999999908 | -0.504 | 0.335 | 0.117 |
| 1.404999999999908 | -0.514 | 0.339 | 0.119 |
| 1.409999999999908 | -0.524 | 0.344 | 0.12 |
| 1.414999999999907 | -0.534 | 0.349 | 0.122 |
| 1.419999999999907 | -0.544 | 0.354 | 0.123 |
| 1.424999999999907 | -0.554 | 0.359 | 0.125 |
| 1.429999999999907 | -0.564 | 0.365 | 0.126 |
| 1.434999999999907 | -0.574 | 0.37 | 0.127 |
| 1.439999999999907 | -0.584 | 0.375 | 0.129 |
| 1.444999999999907 | -0.593 | 0.381 | 0.13 |
| 1.449999999999907 | -0.603 | 0.386 | 0.132 |
| 1.454999999999907 | -0.612 | 0.392 | 0.134 |
| 1.459999999999906 | -0.622 | 0.397 | 0.135 |
| 1.464999999999906 | -0.631 | 0.403 | 0.137 |
| 1.469999999999906 | -0.64 | 0.409 | 0.138 |
| 1.474999999999906 | -0.65 | 0.415 | 0.14 |
| 1.479999999999906 | -0.659 | 0.421 | 0.141 |
| 1.484999999999906 | -0.668 | 0.427 | 0.143 |
| 1.489999999999906 | -0.677 | 0.433 | 0.145 |
| 1.494999999999906 | -0.686 | 0.44 | 0.146 |
| 1.499999999999906 | -0.695 | 0.446 | 0.148 |
| 1.504999999999906 | -0.704 | 0.452 | 0.15 |
| 1.509999999999905 | -0.713 | 0.459 | 0.151 |
| 1.514999999999905 | -0.722 | 0.466 | 0.153 |
| 1.519999999999905 | -0.731 | 0.472 | 0.155 |
| 1.524999999999905 | -0.74 | 0.479 | 0.156 |
| 1.529999999999905 | -0.748 | 0.486 | 0.158 |
| 1.534999999999905 | -0.757 | 0.493 | 0.16 |
| 1.539999999999905 | -0.766 | 0.501 | 0.162 |
| 1.544999999999905 | -0.774 | 0.508 | 0.164 |
| 1.549999999999905 | -0.783 | 0.515 | 0.165 |
| 1.554999999999904 | -0.792 | 0.523 | 0.167 |
| 1.559999999999904 | -0.8 | 0.531 | 0.169 |
| 1.564999999999904 | -0.809 | 0.539 | 0.171 |
| 1.569999999999904 | -0.817 | 0.547 | 0.173 |
| 1.574999999999904 | -0.825 | 0.555 | 0.175 |
| 1.579999999999904 | -0.834 | 0.563 | 0.177 |
| 1.584999999999904 | -0.842 | 0.571 | 0.178 |
| 1.589999999999904 | -0.85 | 0.58 | 0.18 |
| 1.594999999999904 | -0.859 | 0.588 | 0.182 |
| 1.599999999999903 | -0.867 | 0.597 | 0.184 |
| 1.604999999999903 | -0.875 | 0.606 | 0.186 |
| 1.609999999999903 | -0.883 | 0.615 | 0.188 |
| 1.614999999999903 | -0.891 | 0.625 | 0.19 |
| 1.619999999999903 | -0.899 | 0.634 | 0.192 |
| 1.624999999999903 | -0.907 | 0.644 | 0.195 |
| 1.629999999999903 | -0.915 | 0.653 | 0.197 |
| 1.634999999999903 | -0.923 | 0.663 | 0.199 |
| 1.639999999999903 | -0.931 | 0.674 | 0.201 |
| 1.644999999999902 | -0.939 | 0.684 | 0.203 |
| 1.649999999999902 | -0.947 | 0.695 | 0.205 |
| 1.654999999999902 | -0.955 | 0.705 | 0.207 |
| 1.659999999999902 | -0.963 | 0.716 | 0.21 |
| 1.664999999999902 | -0.971 | 0.727 | 0.212 |
| 1.669999999999902 | -0.979 | 0.739 | 0.214 |
| 1.674999999999902 | -0.987 | 0.75 | 0.216 |
| 1.679999999999902 | -0.994 | 0.762 | 0.218 |
| 1.684999999999902 | -1.002 | 0.774 | 0.221 |
| 1.689999999999901 | -1.01 | 0.787 | 0.223 |
| 1.694999999999901 | -1.017 | 0.799 | 0.225 |
| 1.699999999999901 | -1.025 | 0.812 | 0.228 |
| 1.704999999999901 | -1.033 | 0.825 | 0.23 |
| 1.709999999999901 | -1.04 | 0.839 | 0.233 |
| 1.714999999999901 | -1.048 | 0.853 | 0.235 |
| 1.719999999999901 | -1.055 | 0.867 | 0.237 |
| 1.724999999999901 | -1.063 | 0.881 | 0.24 |
| 1.729999999999901 | -1.07 | 0.896 | 0.242 |
| 1.734999999999901 | -1.078 | 0.911 | 0.245 |
| 1.7399999999999 | -1.085 | 0.926 | 0.247 |
| 1.7449999999999 | -1.093 | 0.942 | 0.25 |
| 1.7499999999999 | -1.1 | 0.958 | 0.253 |
| 1.7549999999999 | -1.108 | 0.975 | 0.255 |
| 1.7599999999999 | -1.115 | 0.992 | 0.258 |
| 1.7649999999999 | -1.123 | 1.009 | 0.26 |
| 1.7699999999999 | -1.13 | 1.027 | 0.263 |
| 1.7749999999999 | -1.137 | 1.045 | 0.266 |
| 1.7799999999999 | -1.145 | 1.064 | 0.268 |
| 1.784999999999899 | -1.152 | 1.083 | 0.271 |
| 1.789999999999899 | -1.159 | 1.103 | 0.274 |
| 1.794999999999899 | -1.166 | 1.123 | 0.277 |
| 1.799999999999899 | -1.174 | 1.144 | 0.279 |
| 1.804999999999899 | -1.181 | 1.166 | 0.282 |
| 1.809999999999899 | -1.188 | 1.188 | 0.285 |
| 1.814999999999899 | -1.195 | 1.211 | 0.288 |
| 1.819999999999899 | -1.202 | 1.235 | 0.291 |
| 1.824999999999899 | -1.21 | 1.26 | 0.294 |
| 1.829999999999899 | -1.217 | 1.285 | 0.297 |
| 1.834999999999898 | -1.224 | 1.311 | 0.3 |
| 1.839999999999898 | -1.231 | 1.338 | 0.303 |
| 1.844999999999898 | -1.238 | 1.366 | 0.306 |
| 1.849999999999898 | -1.245 | 1.395 | 0.309 |
| 1.854999999999898 | -1.252 | 1.425 | 0.312 |
| 1.859999999999898 | -1.259 | 1.457 | 0.315 |
| 1.864999999999898 | -1.266 | 1.489 | 0.318 |
| 1.869999999999898 | -1.273 | 1.523 | 0.321 |
| 1.874999999999898 | -1.28 | 1.559 | 0.325 |
| 1.879999999999897 | -1.287 | 1.596 | 0.328 |
| 1.884999999999897 | -1.294 | 1.635 | 0.331 |
| 1.889999999999897 | -1.301 | 1.676 | 0.334 |
| 1.894999999999897 | -1.308 | 1.718 | 0.338 |
| 1.899999999999897 | -1.315 | 1.764 | 0.341 |
| 1.904999999999897 | -1.322 | 1.811 | 0.344 |
| 1.909999999999897 | -1.329 | 1.861 | 0.348 |
| 1.914999999999897 | -1.336 | 1.915 | 0.351 |
| 1.919999999999897 | -1.343 | 1.972 | 0.355 |
| 1.924999999999897 | -1.349 | 2.033 | 0.358 |
| 1.929999999999896 | -1.356 | 2.098 | 0.362 |
| 1.934999999999896 | -1.363 | 2.168 | 0.365 |
| 1.939999999999896 | -1.37 | 2.245 | 0.369 |
| 1.944999999999896 | -1.377 | 2.328 | 0.372 |
| 1.949999999999896 | -1.383 | 2.419 | 0.376 |
| 1.954999999999896 | -1.39 | 2.521 | 0.38 |
| 1.959999999999896 | -1.397 | 2.635 | 0.383 |
| 1.964999999999896 | -1.404 | 2.765 | 0.387 |
| 1.969999999999896 | -1.41 | 2.915 | 0.391 |
| 1.974999999999895 | -1.417 | 3.094 | 0.395 |
| 1.979999999999895 | -1.424 | 3.313 | 0.398 |
| 1.984999999999895 | -1.431 | 3.597 | 0.402 |
| 1.989999999999895 | -1.437 | 3.999 | 0.406 |
| 1.994999999999895 | -1.444 | 4.688 | 0.41 |
| 1.999999999999895 | -1.451 | 29.271 | 0.414 |
| 2.004999999999895 | -1.457 | 4.681 | 0.418 |
| 2.009999999999895 | -1.464 | 3.984 | 0.422 |
| 2.014999999999895 | -1.471 | 3.575 | 0.426 |
| 2.019999999999895 | -1.477 | 3.283 | 0.43 |
| 2.024999999999895 | -1.484 | 3.056 | 0.435 |
| 2.029999999999895 | -1.49 | 2.87 | 0.439 |
| 2.034999999999894 | -1.497 | 2.712 | 0.443 |
| 2.039999999999894 | -1.504 | 2.575 | 0.447 |
| 2.044999999999894 | -1.51 | 2.454 | 0.452 |
| 2.049999999999894 | -1.517 | 2.344 | 0.456 |
| 2.054999999999894 | -1.523 | 2.245 | 0.46 |
| 2.059999999999894 | -1.53 | 2.155 | 0.465 |
| 2.064999999999894 | -1.536 | 2.071 | 0.469 |
| 2.069999999999894 | -1.543 | 1.993 | 0.474 |
| 2.074999999999894 | -1.55 | 1.92 | 0.478 |
| 2.079999999999893 | -1.556 | 1.852 | 0.483 |
| 2.084999999999893 | -1.563 | 1.787 | 0.488 |
| 2.089999999999893 | -1.569 | 1.726 | 0.492 |
| 2.094999999999893 | -1.575 | 1.669 | 0.497 |
| 2.099999999999893 | -1.582 | 1.614 | 0.502 |
| 2.104999999999893 | -1.588 | 1.561 | 0.507 |
| 2.109999999999893 | -1.595 | 1.511 | 0.512 |
| 2.114999999999893 | -1.601 | 1.462 | 0.517 |
| 2.119999999999893 | -1.608 | 1.416 | 0.521 |
| 2.124999999999893 | -1.614 | 1.372 | 0.526 |
| 2.129999999999892 | -1.621 | 1.328 | 0.532 |
| 2.134999999999892 | -1.627 | 1.287 | 0.537 |
| 2.139999999999892 | -1.633 | 1.247 | 0.542 |
| 2.144999999999892 | -1.64 | 1.208 | 0.547 |
| 2.149999999999892 | -1.646 | 1.17 | 0.552 |
| 2.154999999999892 | -1.653 | 1.134 | 0.558 |
| 2.159999999999892 | -1.659 | 1.098 | 0.563 |
| 2.164999999999892 | -1.665 | 1.064 | 0.568 |
| 2.169999999999892 | -1.672 | 1.03 | 0.574 |
| 2.174999999999891 | -1.678 | 0.997 | 0.579 |
| 2.179999999999891 | -1.684 | 0.965 | 0.585 |
| 2.184999999999891 | -1.691 | 0.934 | 0.591 |
| 2.189999999999891 | -1.697 | 0.903 | 0.596 |
| 2.194999999999891 | -1.703 | 0.874 | 0.602 |
| 2.199999999999891 | -1.71 | 0.845 | 0.608 |
| 2.204999999999891 | -1.716 | 0.816 | 0.614 |
| 2.209999999999891 | -1.722 | 0.788 | 0.619 |
| 2.214999999999891 | -1.728 | 0.761 | 0.625 |
| 2.21999999999989 | -1.735 | 0.734 | 0.631 |
| 2.22499999999989 | -1.741 | 0.708 | 0.638 |
| 2.22999999999989 | -1.747 | 0.682 | 0.644 |
| 2.23499999999989 | -1.754 | 0.657 | 0.65 |
| 2.23999999999989 | -1.76 | 0.632 | 0.656 |
| 2.24499999999989 | -1.766 | 0.607 | 0.662 |
| 2.24999999999989 | -1.772 | 0.583 | 0.669 |
| 2.25499999999989 | -1.778 | 0.56 | 0.675 |
| 2.25999999999989 | -1.785 | 0.536 | 0.682 |
| 2.26499999999989 | -1.791 | 0.513 | 0.688 |
| 2.269999999999889 | -1.797 | 0.491 | 0.695 |
| 2.274999999999889 | -1.803 | 0.469 | 0.702 |
| 2.279999999999889 | -1.81 | 0.447 | 0.709 |
| 2.284999999999889 | -1.816 | 0.425 | 0.716 |
| 2.289999999999889 | -1.822 | 0.404 | 0.722 |
| 2.294999999999889 | -1.828 | 0.383 | 0.729 |
| 2.299999999999889 | -1.834 | 0.363 | 0.737 |
| 2.304999999999889 | -1.84 | 0.342 | 0.744 |
| 2.309999999999889 | -1.847 | 0.322 | 0.751 |
| 2.314999999999888 | -1.853 | 0.302 | 0.758 |
| 2.319999999999888 | -1.859 | 0.283 | 0.766 |
| 2.324999999999888 | -1.865 | 0.263 | 0.773 |
| 2.329999999999888 | -1.871 | 0.244 | 0.781 |
| 2.334999999999888 | -1.877 | 0.225 | 0.788 |
| 2.339999999999888 | -1.883 | 0.207 | 0.796 |
| 2.344999999999888 | -1.889 | 0.188 | 0.804 |
| 2.349999999999888 | -1.896 | 0.17 | 0.812 |
| 2.354999999999888 | -1.902 | 0.152 | 0.82 |
| 2.359999999999887 | -1.908 | 0.134 | 0.828 |
| 2.364999999999887 | -1.914 | 0.116 | 0.836 |
| 2.369999999999887 | -1.92 | 0.099 | 0.844 |
| 2.374999999999887 | -1.926 | 0.082 | 0.853 |
| 2.379999999999887 | -1.932 | 0.065 | 0.861 |
| 2.384999999999887 | -1.938 | 0.048 | 0.87 |
| 2.389999999999887 | -1.944 | 0.031 | 0.878 |
| 2.394999999999887 | -1.95 | 0.014 | 0.887 |
| 2.399999999999887 | -1.956 | -0.002 | 0.896 |
| 2.404999999999887 | -1.962 | -0.018 | 0.905 |
| 2.409999999999886 | -1.968 | -0.035 | 0.914 |
| 2.414999999999886 | -1.974 | -0.051 | 0.923 |
| 2.419999999999886 | -1.981 | -0.066 | 0.932 |
| 2.424999999999886 | -1.987 | -0.082 | 0.942 |
| 2.429999999999886 | -1.993 | -0.098 | 0.951 |
| 2.434999999999886 | -1.999 | -0.113 | 0.961 |
| 2.439999999999886 | -2.005 | -0.128 | 0.97 |
| 2.444999999999886 | -2.011 | -0.144 | 0.98 |
| 2.449999999999886 | -2.017 | -0.159 | 0.99 |
| 2.454999999999885 | -2.023 | -0.174 | 1 |
| 2.459999999999885 | -2.029 | -0.188 | 1.01 |
| 2.464999999999885 | -2.035 | -0.203 | 1.021 |
| 2.469999999999885 | -2.041 | -0.218 | 1.031 |
| 2.474999999999885 | -2.047 | -0.232 | 1.042 |
| 2.479999999999885 | -2.053 | -0.246 | 1.053 |
| 2.484999999999885 | -2.058 | -0.261 | 1.063 |
| 2.489999999999885 | -2.064 | -0.275 | 1.074 |
| 2.494999999999885 | -2.07 | -0.289 | 1.086 |
| 2.499999999999884 | -2.076 | -0.303 | 1.097 |
| 2.504999999999884 | -2.082 | -0.317 | 1.108 |
| 2.509999999999884 | -2.088 | -0.33 | 1.12 |
| 2.514999999999884 | -2.094 | -0.344 | 1.132 |
| 2.519999999999884 | -2.1 | -0.358 | 1.144 |
| 2.524999999999884 | -2.106 | -0.371 | 1.156 |
| 2.529999999999884 | -2.112 | -0.384 | 1.168 |
| 2.534999999999884 | -2.118 | -0.398 | 1.18 |
| 2.539999999999884 | -2.124 | -0.411 | 1.193 |
| 2.544999999999884 | -2.13 | -0.424 | 1.206 |
| 2.549999999999883 | -2.136 | -0.437 | 1.218 |
| 2.554999999999883 | -2.142 | -0.45 | 1.232 |
| 2.559999999999883 | -2.147 | -0.463 | 1.245 |
| 2.564999999999883 | -2.153 | -0.476 | 1.258 |
| 2.569999999999883 | -2.159 | -0.488 | 1.272 |
| 2.574999999999883 | -2.165 | -0.501 | 1.286 |
| 2.579999999999883 | -2.171 | -0.514 | 1.3 |
| 2.584999999999883 | -2.177 | -0.526 | 1.314 |
| 2.589999999999883 | -2.183 | -0.538 | 1.329 |
| 2.594999999999882 | -2.189 | -0.551 | 1.344 |
| 2.599999999999882 | -2.195 | -0.563 | 1.359 |
| 2.604999999999882 | -2.2 | -0.575 | 1.374 |
| 2.609999999999882 | -2.206 | -0.587 | 1.389 |
| 2.614999999999882 | -2.212 | -0.6 | 1.405 |
| 2.619999999999882 | -2.218 | -0.612 | 1.421 |
| 2.624999999999882 | -2.224 | -0.624 | 1.437 |
| 2.629999999999882 | -2.23 | -0.635 | 1.454 |
| 2.634999999999882 | -2.236 | -0.647 | 1.47 |
| 2.639999999999881 | -2.241 | -0.659 | 1.487 |
| 2.644999999999881 | -2.247 | -0.671 | 1.505 |
| 2.649999999999881 | -2.253 | -0.682 | 1.522 |
| 2.654999999999881 | -2.259 | -0.694 | 1.54 |
| 2.659999999999881 | -2.265 | -0.705 | 1.558 |
| 2.664999999999881 | -2.27 | -0.717 | 1.577 |
| 2.669999999999881 | -2.276 | -0.728 | 1.596 |
| 2.674999999999881 | -2.282 | -0.74 | 1.615 |
| 2.679999999999881 | -2.288 | -0.751 | 1.635 |
| 2.68499999999988 | -2.294 | -0.762 | 1.655 |
| 2.68999999999988 | -2.3 | -0.774 | 1.675 |
| 2.69499999999988 | -2.305 | -0.785 | 1.696 |
| 2.69999999999988 | -2.311 | -0.796 | 1.717 |
| 2.70499999999988 | -2.317 | -0.807 | 1.738 |
| 2.70999999999988 | -2.323 | -0.818 | 1.76 |
| 2.71499999999988 | -2.329 | -0.829 | 1.783 |
| 2.71999999999988 | -2.334 | -0.84 | 1.805 |
| 2.72499999999988 | -2.34 | -0.851 | 1.829 |
| 2.72999999999988 | -2.346 | -0.861 | 1.853 |
| 2.734999999999879 | -2.352 | -0.872 | 1.877 |
| 2.739999999999879 | -2.357 | -0.883 | 1.902 |
| 2.744999999999879 | -2.363 | -0.894 | 1.927 |
| 2.749999999999879 | -2.369 | -0.904 | 1.953 |
| 2.754999999999879 | -2.375 | -0.915 | 1.98 |
| 2.759999999999879 | -2.38 | -0.925 | 2.007 |
| 2.764999999999879 | -2.386 | -0.936 | 2.035 |
| 2.769999999999879 | -2.392 | -0.946 | 2.064 |
| 2.774999999999879 | -2.398 | -0.957 | 2.093 |
| 2.779999999999878 | -2.403 | -0.967 | 2.123 |
| 2.784999999999878 | -2.409 | -0.977 | 2.154 |
| 2.789999999999878 | -2.415 | -0.988 | 2.185 |
| 2.794999999999878 | -2.421 | -0.998 | 2.218 |
| 2.799999999999878 | -2.426 | -1.008 | 2.251 |
| 2.804999999999878 | -2.432 | -1.018 | 2.285 |
| 2.809999999999878 | -2.438 | -1.029 | 2.32 |
| 2.814999999999878 | -2.444 | -1.039 | 2.357 |
| 2.819999999999878 | -2.449 | -1.049 | 2.394 |
| 2.824999999999878 | -2.455 | -1.059 | 2.433 |
| 2.829999999999877 | -2.461 | -1.069 | 2.472 |
| 2.834999999999877 | -2.466 | -1.079 | 2.514 |
| 2.839999999999877 | -2.472 | -1.089 | 2.556 |
| 2.844999999999877 | -2.478 | -1.099 | 2.6 |
| 2.849999999999877 | -2.484 | -1.109 | 2.645 |
| 2.854999999999877 | -2.489 | -1.118 | 2.692 |
| 2.859999999999877 | -2.495 | -1.128 | 2.741 |
| 2.864999999999877 | -2.501 | -1.138 | 2.792 |
| 2.869999999999877 | -2.506 | -1.148 | 2.845 |
| 2.874999999999876 | -2.512 | -1.157 | 2.9 |
| 2.879999999999876 | -2.518 | -1.167 | 2.958 |
| 2.884999999999876 | -2.523 | -1.177 | 3.018 |
| 2.889999999999876 | -2.529 | -1.186 | 3.081 |
| 2.894999999999876 | -2.535 | -1.196 | 3.147 |
| 2.899999999999876 | -2.54 | -1.205 | 3.216 |
| 2.904999999999876 | -2.546 | -1.215 | 3.29 |
| 2.909999999999876 | -2.552 | -1.224 | 3.367 |
| 2.914999999999876 | -2.557 | -1.234 | 3.449 |
| 2.919999999999876 | -2.563 | -1.243 | 3.536 |
| 2.924999999999875 | -2.569 | -1.253 | 3.629 |
| 2.929999999999875 | -2.574 | -1.262 | 3.729 |
| 2.934999999999875 | -2.58 | -1.271 | 3.836 |
| 2.939999999999875 | -2.586 | -1.281 | 3.953 |
| 2.944999999999875 | -2.591 | -1.29 | 4.079 |
| 2.949999999999875 | -2.597 | -1.299 | 4.219 |
| 2.954999999999875 | -2.603 | -1.309 | 4.373 |
| 2.959999999999875 | -2.608 | -1.318 | 4.546 |
| 2.964999999999875 | -2.614 | -1.327 | 4.742 |
| 2.969999999999874 | -2.62 | -1.336 | 4.97 |
| 2.974999999999874 | -2.625 | -1.345 | 5.24 |
| 2.979999999999874 | -2.631 | -1.354 | 5.571 |
| 2.984999999999874 | -2.637 | -1.363 | 5.998 |
| 2.989999999999874 | -2.642 | -1.373 | 6.603 |
| 2.994999999999874 | -2.648 | -1.382 | 7.639 |
| 2.999999999999874 | -2.653 | -1.391 | 44.24 |
| 3.004999999999874 | -2.659 | -1.4 | 7.631 |
| 3.009999999999874 | -2.665 | -1.409 | 6.588 |
| 3.014999999999874 | -2.67 | -1.417 | 5.976 |
| 3.019999999999873 | -2.676 | -1.426 | 5.541 |
| 3.024999999999873 | -2.682 | -1.435 | 5.202 |
| 3.029999999999873 | -2.687 | -1.444 | 4.925 |
| 3.034999999999873 | -2.693 | -1.453 | 4.69 |
| 3.039999999999873 | -2.698 | -1.462 | 4.486 |
| 3.044999999999873 | -2.704 | -1.471 | 4.305 |
| 3.049999999999873 | -2.71 | -1.479 | 4.144 |
| 3.054999999999873 | -2.715 | -1.488 | 3.997 |
| 3.059999999999873 | -2.721 | -1.497 | 3.863 |
| 3.064999999999872 | -2.726 | -1.506 | 3.739 |
| 3.069999999999872 | -2.732 | -1.514 | 3.624 |
| 3.074999999999872 | -2.738 | -1.523 | 3.517 |
| 3.079999999999872 | -2.743 | -1.532 | 3.416 |
| 3.084999999999872 | -2.749 | -1.54 | 3.321 |
| 3.089999999999872 | -2.754 | -1.549 | 3.232 |
| 3.094999999999872 | -2.76 | -1.557 | 3.147 |
| 3.099999999999872 | -2.765 | -1.566 | 3.066 |
| 3.104999999999872 | -2.771 | -1.575 | 2.989 |
| 3.109999999999872 | -2.777 | -1.583 | 2.916 |
| 3.114999999999871 | -2.782 | -1.592 | 2.845 |
| 3.119999999999871 | -2.788 | -1.6 | 2.778 |
| 3.124999999999871 | -2.793 | -1.609 | 2.713 |
| 3.129999999999871 | -2.799 | -1.617 | 2.65 |
| 3.134999999999871 | -2.804 | -1.626 | 2.59 |
| 3.139999999999871 | -2.81 | -1.634 | 2.531 |
| 3.144999999999871 | -2.816 | -1.642 | 2.475 |
| 3.149999999999871 | -2.821 | -1.651 | 2.42 |
| 3.154999999999871 | -2.827 | -1.659 | 2.367 |
| 3.15999999999987 | -2.832 | -1.667 | 2.316 |
| 3.16499999999987 | -2.838 | -1.676 | 2.266 |
| 3.16999999999987 | -2.843 | -1.684 | 2.217 |
| 3.17499999999987 | -2.849 | -1.692 | 2.17 |
| 3.17999999999987 | -2.855 | -1.701 | 2.124 |
| 3.18499999999987 | -2.86 | -1.709 | 2.079 |
| 3.18999999999987 | -2.866 | -1.717 | 2.035 |
| 3.19499999999987 | -2.871 | -1.725 | 1.993 |
| 3.19999999999987 | -2.877 | -1.734 | 1.951 |
| 3.204999999999869 | -2.882 | -1.742 | 1.91 |
| 3.209999999999869 | -2.888 | -1.75 | 1.87 |
| 3.214999999999869 | -2.893 | -1.758 | 1.831 |
| 3.219999999999869 | -2.899 | -1.766 | 1.793 |
| 3.224999999999869 | -2.904 | -1.774 | 1.755 |
| 3.229999999999869 | -2.91 | -1.783 | 1.719 |
| 3.234999999999869 | -2.915 | -1.791 | 1.683 |
| 3.239999999999869 | -2.921 | -1.799 | 1.647 |
| 3.244999999999869 | -2.926 | -1.807 | 1.612 |
| 3.249999999999869 | -2.932 | -1.815 | 1.578 |
| 3.254999999999868 | -2.938 | -1.823 | 1.545 |
| 3.259999999999868 | -2.943 | -1.831 | 1.512 |
| 3.264999999999868 | -2.949 | -1.839 | 1.48 |
| 3.269999999999868 | -2.954 | -1.847 | 1.448 |
| 3.274999999999868 | -2.96 | -1.855 | 1.416 |
| 3.279999999999868 | -2.965 | -1.863 | 1.386 |
| 3.284999999999868 | -2.971 | -1.871 | 1.355 |
| 3.289999999999868 | -2.976 | -1.879 | 1.325 |
| 3.294999999999868 | -2.982 | -1.887 | 1.296 |
| 3.299999999999867 | -2.987 | -1.895 | 1.267 |
| 3.304999999999867 | -2.993 | -1.903 | 1.238 |
| 3.309999999999867 | -2.998 | -1.91 | 1.21 |
| 3.314999999999867 | -3.004 | -1.918 | 1.182 |
| 3.319999999999867 | -3.009 | -1.926 | 1.155 |
| 3.324999999999867 | -3.015 | -1.934 | 1.128 |
| 3.329999999999867 | -3.02 | -1.942 | 1.101 |
| 3.334999999999867 | -3.026 | -1.95 | 1.075 |
| 3.339999999999867 | -3.031 | -1.957 | 1.049 |
| 3.344999999999866 | -3.037 | -1.965 | 1.023 |
| 3.349999999999866 | -3.042 | -1.973 | 0.997 |
| 3.354999999999866 | -3.048 | -1.981 | 0.972 |
| 3.359999999999866 | -3.053 | -1.989 | 0.948 |
| 3.364999999999866 | -3.059 | -1.996 | 0.923 |
| 3.369999999999866 | -3.064 | -2.004 | 0.899 |
| 3.374999999999866 | -3.07 | -2.012 | 0.875 |
| 3.379999999999866 | -3.075 | -2.019 | 0.851 |
| 3.384999999999866 | -3.081 | -2.027 | 0.828 |
| 3.389999999999866 | -3.086 | -2.035 | 0.805 |
| 3.394999999999865 | -3.091 | -2.042 | 0.782 |
| 3.399999999999865 | -3.097 | -2.05 | 0.759 |
| 3.404999999999865 | -3.102 | -2.058 | 0.736 |
| 3.409999999999865 | -3.108 | -2.065 | 0.714 |
| 3.414999999999865 | -3.113 | -2.073 | 0.692 |
| 3.419999999999865 | -3.119 | -2.081 | 0.67 |
| 3.424999999999865 | -3.124 | -2.088 | 0.649 |
| 3.429999999999865 | -3.13 | -2.096 | 0.627 |
| 3.434999999999865 | -3.135 | -2.103 | 0.606 |
| 3.439999999999864 | -3.141 | -2.111 | 0.585 |
| 3.444999999999864 | -3.146 | -2.118 | 0.564 |
| 3.449999999999864 | -3.152 | -2.126 | 0.544 |
| 3.454999999999864 | -3.157 | -2.133 | 0.523 |
| 3.459999999999864 | -3.163 | -2.141 | 0.503 |
| 3.464999999999864 | -3.168 | -2.148 | 0.483 |
| 3.469999999999864 | -3.173 | -2.156 | 0.463 |
| 3.474999999999864 | -3.179 | -2.163 | 0.444 |
| 3.479999999999864 | -3.184 | -2.171 | 0.424 |
| 3.484999999999864 | -3.19 | -2.178 | 0.405 |
| 3.489999999999863 | -3.195 | -2.186 | 0.385 |
| 3.494999999999863 | -3.201 | -2.193 | 0.366 |
| 3.499999999999863 | -3.206 | -2.201 | 0.347 |
| 3.504999999999863 | -3.212 | -2.208 | 0.329 |
| 3.509999999999863 | -3.217 | -2.216 | 0.31 |
| 3.514999999999863 | -3.222 | -2.223 | 0.292 |
| 3.519999999999863 | -3.228 | -2.23 | 0.273 |
| 3.524999999999863 | -3.233 | -2.238 | 0.255 |
| 3.529999999999863 | -3.239 | -2.245 | 0.237 |
| 3.534999999999862 | -3.244 | -2.252 | 0.219 |
| 3.539999999999862 | -3.25 | -2.26 | 0.201 |
| 3.544999999999862 | -3.255 | -2.267 | 0.184 |
| 3.549999999999862 | -3.26 | -2.274 | 0.166 |
| 3.554999999999862 | -3.266 | -2.282 | 0.149 |
| 3.559999999999862 | -3.271 | -2.289 | 0.131 |
| 3.564999999999862 | -3.277 | -2.296 | 0.114 |
| 3.569999999999862 | -3.282 | -2.304 | 0.097 |
| 3.574999999999862 | -3.288 | -2.311 | 0.08 |
| 3.579999999999862 | -3.293 | -2.318 | 0.063 |
| 3.584999999999861 | -3.298 | -2.325 | 0.046 |
| 3.589999999999861 | -3.304 | -2.333 | 0.03 |
| 3.594999999999861 | -3.309 | -2.34 | 0.013 |
| 3.599999999999861 | -3.315 | -2.347 | -0.003 |
| 3.604999999999861 | -3.32 | -2.354 | -0.019 |
| 3.609999999999861 | -3.326 | -2.362 | -0.036 |
| 3.614999999999861 | -3.331 | -2.369 | -0.052 |
| 3.619999999999861 | -3.336 | -2.376 | -0.068 |
| 3.62499999999986 | -3.342 | -2.383 | -0.084 |
| 3.62999999999986 | -3.347 | -2.39 | -0.1 |
| 3.63499999999986 | -3.353 | -2.398 | -0.115 |
| 3.63999999999986 | -3.358 | -2.405 | -0.131 |
| 3.64499999999986 | -3.363 | -2.412 | -0.146 |
| 3.64999999999986 | -3.369 | -2.419 | -0.162 |
| 3.65499999999986 | -3.374 | -2.426 | -0.177 |
| 3.65999999999986 | -3.38 | -2.433 | -0.193 |
| 3.66499999999986 | -3.385 | -2.441 | -0.208 |
| 3.669999999999859 | -3.39 | -2.448 | -0.223 |
| 3.674999999999859 | -3.396 | -2.455 | -0.238 |
| 3.679999999999859 | -3.401 | -2.462 | -0.253 |
| 3.684999999999859 | -3.407 | -2.469 | -0.268 |
| 3.689999999999859 | -3.412 | -2.476 | -0.282 |
| 3.694999999999859 | -3.417 | -2.483 | -0.297 |
| 3.699999999999859 | -3.423 | -2.49 | -0.312 |
| 3.704999999999859 | -3.428 | -2.497 | -0.326 |
| 3.709999999999859 | -3.434 | -2.504 | -0.341 |
| 3.714999999999859 | -3.439 | -2.511 | -0.355 |
| 3.719999999999858 | -3.444 | -2.518 | -0.37 |
| 3.724999999999858 | -3.45 | -2.525 | -0.384 |
| 3.729999999999858 | -3.455 | -2.532 | -0.398 |
| 3.734999999999858 | -3.461 | -2.539 | -0.412 |
| 3.739999999999858 | -3.466 | -2.546 | -0.426 |
| 3.744999999999858 | -3.471 | -2.553 | -0.44 |
| 3.749999999999858 | -3.477 | -2.56 | -0.454 |
| 3.754999999999858 | -3.482 | -2.567 | -0.468 |
| 3.759999999999858 | -3.487 | -2.574 | -0.482 |
| 3.764999999999857 | -3.493 | -2.581 | -0.496 |
| 3.769999999999857 | -3.498 | -2.588 | -0.509 |
| 3.774999999999857 | -3.504 | -2.595 | -0.523 |
| 3.779999999999857 | -3.509 | -2.602 | -0.536 |
| 3.784999999999857 | -3.514 | -2.609 | -0.55 |
| 3.789999999999857 | -3.52 | -2.616 | -0.563 |
| 3.794999999999857 | -3.525 | -2.623 | -0.577 |
| 3.799999999999857 | -3.531 | -2.63 | -0.59 |
| 3.804999999999857 | -3.536 | -2.637 | -0.603 |
| 3.809999999999857 | -3.541 | -2.644 | -0.616 |
| 3.814999999999856 | -3.547 | -2.651 | -0.629 |
| 3.819999999999856 | -3.552 | -2.658 | -0.643 |
| 3.824999999999856 | -3.557 | -2.664 | -0.656 |
| 3.829999999999856 | -3.563 | -2.671 | -0.669 |
| 3.834999999999856 | -3.568 | -2.678 | -0.681 |
| 3.839999999999856 | -3.573 | -2.685 | -0.694 |
| 3.844999999999856 | -3.579 | -2.692 | -0.707 |
| 3.849999999999856 | -3.584 | -2.699 | -0.72 |
| 3.854999999999856 | -3.59 | -2.706 | -0.733 |
| 3.859999999999855 | -3.595 | -2.712 | -0.745 |
| 3.864999999999855 | -3.6 | -2.719 | -0.758 |
| 3.869999999999855 | -3.606 | -2.726 | -0.77 |
| 3.874999999999855 | -3.611 | -2.733 | -0.783 |
| 3.879999999999855 | -3.616 | -2.74 | -0.795 |
| 3.884999999999855 | -3.622 | -2.747 | -0.808 |
| 3.889999999999855 | -3.627 | -2.753 | -0.82 |
| 3.894999999999855 | -3.632 | -2.76 | -0.832 |
| 3.899999999999855 | -3.638 | -2.767 | -0.845 |
| 3.904999999999855 | -3.643 | -2.774 | -0.857 |
| 3.909999999999854 | -3.648 | -2.78 | -0.869 |
| 3.914999999999854 | -3.654 | -2.787 | -0.881 |
| 3.919999999999854 | -3.659 | -2.794 | -0.893 |
| 3.924999999999854 | -3.664 | -2.801 | -0.905 |
| 3.929999999999854 | -3.67 | -2.807 | -0.917 |
| 3.934999999999854 | -3.675 | -2.814 | -0.929 |
| 3.939999999999854 | -3.681 | -2.821 | -0.941 |
| 3.944999999999854 | -3.686 | -2.828 | -0.953 |
| 3.949999999999854 | -3.691 | -2.834 | -0.965 |
| 3.954999999999853 | -3.697 | -2.841 | -0.977 |
| 3.959999999999853 | -3.702 | -2.848 | -0.988 |
| 3.964999999999853 | -3.707 | -2.855 | -1 |
| 3.969999999999853 | -3.713 | -2.861 | -1.012 |
| 3.974999999999853 | -3.718 | -2.868 | -1.024 |
| 3.979999999999853 | -3.723 | -2.875 | -1.035 |
| 3.984999999999853 | -3.729 | -2.881 | -1.047 |
| 3.989999999999853 | -3.734 | -2.888 | -1.058 |
| 3.994999999999853 | -3.739 | -2.895 | -1.07 |
| 3.999999999999853 | -3.745 | -2.901 | -1.081 |
| 4.004999999999852 | -3.75 | -2.908 | -1.093 |
| 4.009999999999852 | -3.755 | -2.915 | -1.104 |
| 4.014999999999852 | -3.761 | -2.921 | -1.115 |
| 4.019999999999852 | -3.766 | -2.928 | -1.127 |
| 4.024999999999852 | -3.771 | -2.935 | -1.138 |
| 4.029999999999852 | -3.777 | -2.941 | -1.149 |
| 4.034999999999852 | -3.782 | -2.948 | -1.16 |
| 4.039999999999851 | -3.787 | -2.955 | -1.171 |
| 4.044999999999852 | -3.793 | -2.961 | -1.183 |
| 4.049999999999851 | -3.798 | -2.968 | -1.194 |
| 4.054999999999851 | -3.803 | -2.974 | -1.205 |
| 4.059999999999851 | -3.809 | -2.981 | -1.216 |
| 4.064999999999851 | -3.814 | -2.988 | -1.227 |
| 4.069999999999851 | -3.819 | -2.994 | -1.238 |
| 4.074999999999851 | -3.824 | -3.001 | -1.249 |
| 4.07999999999985 | -3.83 | -3.007 | -1.26 |
| 4.084999999999851 | -3.835 | -3.014 | -1.27 |
| 4.08999999999985 | -3.84 | -3.021 | -1.281 |
| 4.094999999999851 | -3.846 | -3.027 | -1.292 |
| 4.09999999999985 | -3.851 | -3.034 | -1.303 |
| 4.10499999999985 | -3.856 | -3.04 | -1.314 |
| 4.10999999999985 | -3.862 | -3.047 | -1.324 |
| 4.11499999999985 | -3.867 | -3.053 | -1.335 |
| 4.11999999999985 | -3.872 | -3.06 | -1.346 |
| 4.12499999999985 | -3.878 | -3.066 | -1.356 |
| 4.12999999999985 | -3.883 | -3.073 | -1.367 |
| 4.13499999999985 | -3.888 | -3.079 | -1.377 |
| 4.13999999999985 | -3.894 | -3.086 | -1.388 |
| 4.144999999999849 | -3.899 | -3.093 | -1.398 |
| 4.14999999999985 | -3.904 | -3.099 | -1.409 |
| 4.154999999999849 | -3.91 | -3.106 | -1.419 |
| 4.15999999999985 | -3.915 | -3.112 | -1.43 |
| 4.164999999999849 | -3.92 | -3.119 | -1.44 |
| 4.169999999999849 | -3.925 | -3.125 | -1.451 |
| 4.174999999999849 | -3.931 | -3.132 | -1.461 |
| 4.179999999999848 | -3.936 | -3.138 | -1.471 |
| 4.184999999999849 | -3.941 | -3.144 | -1.482 |
| 4.189999999999848 | -3.947 | -3.151 | -1.492 |
| 4.194999999999848 | -3.952 | -3.157 | -1.502 |
| 4.199999999999848 | -3.957 | -3.164 | -1.512 |
| 4.204999999999848 | -3.963 | -3.17 | -1.523 |
| 4.209999999999848 | -3.968 | -3.177 | -1.533 |
| 4.214999999999848 | -3.973 | -3.183 | -1.543 |
| 4.219999999999847 | -3.978 | -3.19 | -1.553 |
| 4.224999999999848 | -3.984 | -3.196 | -1.563 |
| 4.229999999999847 | -3.989 | -3.203 | -1.573 |
| 4.234999999999847 | -3.994 | -3.209 | -1.583 |
| 4.239999999999847 | -4 | -3.215 | -1.593 |
| 4.244999999999847 | -4.005 | -3.222 | -1.603 |
| 4.249999999999847 | -4.01 | -3.228 | -1.613 |
| 4.254999999999847 | -4.016 | -3.235 | -1.623 |
| 4.259999999999846 | -4.021 | -3.241 | -1.633 |
| 4.264999999999847 | -4.026 | -3.248 | -1.643 |
| 4.269999999999846 | -4.031 | -3.254 | -1.653 |
| 4.274999999999846 | -4.037 | -3.26 | -1.663 |
| 4.279999999999846 | -4.042 | -3.267 | -1.673 |
| 4.284999999999846 | -4.047 | -3.273 | -1.682 |
| 4.289999999999846 | -4.053 | -3.28 | -1.692 |
| 4.294999999999846 | -4.058 | -3.286 | -1.702 |
| 4.299999999999846 | -4.063 | -3.292 | -1.712 |
| 4.304999999999846 | -4.068 | -3.299 | -1.721 |
| 4.309999999999845 | -4.074 | -3.305 | -1.731 |
| 4.314999999999846 | -4.079 | -3.311 | -1.741 |
| 4.319999999999845 | -4.084 | -3.318 | -1.751 |
| 4.324999999999846 | -4.09 | -3.324 | -1.76 |
| 4.329999999999845 | -4.095 | -3.331 | -1.77 |
| 4.334999999999845 | -4.1 | -3.337 | -1.779 |
| 4.339999999999845 | -4.105 | -3.343 | -1.789 |
| 4.344999999999845 | -4.111 | -3.35 | -1.799 |
| 4.349999999999845 | -4.116 | -3.356 | -1.808 |
| 4.354999999999845 | -4.121 | -3.362 | -1.818 |
| 4.359999999999844 | -4.126 | -3.369 | -1.827 |
| 4.364999999999845 | -4.132 | -3.375 | -1.837 |
| 4.369999999999844 | -4.137 | -3.381 | -1.846 |
| 4.374999999999844 | -4.142 | -3.388 | -1.856 |
| 4.379999999999844 | -4.148 | -3.394 | -1.865 |
| 4.384999999999844 | -4.153 | -3.4 | -1.874 |
| 4.389999999999844 | -4.158 | -3.407 | -1.884 |
| 4.394999999999844 | -4.163 | -3.413 | -1.893 |
| 4.399999999999844 | -4.169 | -3.419 | -1.902 |
| 4.404999999999844 | -4.174 | -3.425 | -1.912 |
| 4.409999999999843 | -4.179 | -3.432 | -1.921 |
| 4.414999999999844 | -4.185 | -3.438 | -1.93 |
| 4.419999999999843 | -4.19 | -3.444 | -1.94 |
| 4.424999999999843 | -4.195 | -3.451 | -1.949 |
| 4.429999999999843 | -4.2 | -3.457 | -1.958 |
| 4.434999999999843 | -4.206 | -3.463 | -1.967 |
| 4.439999999999843 | -4.211 | -3.469 | -1.977 |
| 4.444999999999843 | -4.216 | -3.476 | -1.986 |
| 4.449999999999842 | -4.221 | -3.482 | -1.995 |
| 4.454999999999843 | -4.227 | -3.488 | -2.004 |
| 4.459999999999842 | -4.232 | -3.495 | -2.013 |
| 4.464999999999843 | -4.237 | -3.501 | -2.022 |
| 4.469999999999842 | -4.242 | -3.507 | -2.032 |
| 4.474999999999842 | -4.248 | -3.513 | -2.041 |
| 4.479999999999842 | -4.253 | -3.52 | -2.05 |
| 4.484999999999842 | -4.258 | -3.526 | -2.059 |
| 4.489999999999842 | -4.263 | -3.532 | -2.068 |
| 4.494999999999842 | -4.269 | -3.538 | -2.077 |
| 4.499999999999841 | -4.274 | -3.544 | -2.086 |
| 4.504999999999842 | -4.279 | -3.551 | -2.095 |
| 4.509999999999841 | -4.285 | -3.557 | -2.104 |
| 4.514999999999842 | -4.29 | -3.563 | -2.113 |
| 4.519999999999841 | -4.295 | -3.569 | -2.122 |
| 4.524999999999841 | -4.3 | -3.576 | -2.131 |
| 4.529999999999841 | -4.306 | -3.582 | -2.14 |
| 4.534999999999841 | -4.311 | -3.588 | -2.148 |
| 4.53999999999984 | -4.316 | -3.594 | -2.157 |
| 4.544999999999841 | -4.321 | -3.6 | -2.166 |
| 4.54999999999984 | -4.327 | -3.607 | -2.175 |
| 4.554999999999841 | -4.332 | -3.613 | -2.184 |
| 4.55999999999984 | -4.337 | -3.619 | -2.193 |
| 4.564999999999841 | -4.342 | -3.625 | -2.202 |
| 4.56999999999984 | -4.348 | -3.631 | -2.21 |
| 4.57499999999984 | -4.353 | -3.638 | -2.219 |
| 4.57999999999984 | -4.358 | -3.644 | -2.228 |
| 4.58499999999984 | -4.363 | -3.65 | -2.237 |
| 4.58999999999984 | -4.369 | -3.656 | -2.245 |
| 4.59499999999984 | -4.374 | -3.662 | -2.254 |
| 4.59999999999984 | -4.379 | -3.668 | -2.263 |
| 4.60499999999984 | -4.384 | -3.675 | -2.271 |
| 4.60999999999984 | -4.39 | -3.681 | -2.28 |
| 4.614999999999839 | -4.395 | -3.687 | -2.289 |
| 4.61999999999984 | -4.4 | -3.693 | -2.297 |
| 4.624999999999839 | -4.405 | -3.699 | -2.306 |
| 4.62999999999984 | -4.411 | -3.705 | -2.315 |
| 4.634999999999839 | -4.416 | -3.712 | -2.323 |
| 4.639999999999838 | -4.421 | -3.718 | -2.332 |
| 4.644999999999839 | -4.426 | -3.724 | -2.341 |
| 4.649999999999838 | -4.432 | -3.73 | -2.349 |
| 4.654999999999839 | -4.437 | -3.736 | -2.358 |
| 4.659999999999838 | -4.442 | -3.742 | -2.366 |
| 4.664999999999838 | -4.447 | -3.748 | -2.375 |
| 4.669999999999838 | -4.453 | -3.754 | -2.383 |
| 4.674999999999838 | -4.458 | -3.761 | -2.392 |
| 4.679999999999837 | -4.463 | -3.767 | -2.4 |
| 4.684999999999838 | -4.468 | -3.773 | -2.409 |
| 4.689999999999837 | -4.473 | -3.779 | -2.417 |
| 4.694999999999838 | -4.479 | -3.785 | -2.426 |
| 4.699999999999837 | -4.484 | -3.791 | -2.434 |
| 4.704999999999837 | -4.489 | -3.797 | -2.443 |
| 4.709999999999837 | -4.494 | -3.803 | -2.451 |
| 4.714999999999837 | -4.5 | -3.809 | -2.459 |
| 4.719999999999837 | -4.505 | -3.816 | -2.468 |
| 4.724999999999837 | -4.51 | -3.822 | -2.476 |
| 4.729999999999836 | -4.515 | -3.828 | -2.485 |
| 4.734999999999836 | -4.521 | -3.834 | -2.493 |
| 4.739999999999836 | -4.526 | -3.84 | -2.501 |
| 4.744999999999836 | -4.531 | -3.846 | -2.51 |
| 4.749999999999836 | -4.536 | -3.852 | -2.518 |
| 4.754999999999836 | -4.542 | -3.858 | -2.526 |
| 4.759999999999836 | -4.547 | -3.864 | -2.534 |
| 4.764999999999836 | -4.552 | -3.87 | -2.543 |
| 4.769999999999836 | -4.557 | -3.876 | -2.551 |
| 4.774999999999835 | -4.562 | -3.882 | -2.559 |
| 4.779999999999835 | -4.568 | -3.888 | -2.568 |
| 4.784999999999835 | -4.573 | -3.895 | -2.576 |
| 4.789999999999835 | -4.578 | -3.901 | -2.584 |
| 4.794999999999835 | -4.583 | -3.907 | -2.592 |
| 4.799999999999835 | -4.589 | -3.913 | -2.6 |
| 4.804999999999835 | -4.594 | -3.919 | -2.609 |
| 4.809999999999835 | -4.599 | -3.925 | -2.617 |
| 4.814999999999835 | -4.604 | -3.931 | -2.625 |
| 4.819999999999835 | -4.609 | -3.937 | -2.633 |
| 4.824999999999835 | -4.615 | -3.943 | -2.641 |
| 4.829999999999834 | -4.62 | -3.949 | -2.65 |
| 4.834999999999834 | -4.625 | -3.955 | -2.658 |
| 4.839999999999834 | -4.63 | -3.961 | -2.666 |
| 4.844999999999834 | -4.636 | -3.967 | -2.674 |
| 4.849999999999834 | -4.641 | -3.973 | -2.682 |
| 4.854999999999834 | -4.646 | -3.979 | -2.69 |
| 4.859999999999834 | -4.651 | -3.985 | -2.698 |
| 4.864999999999834 | -4.656 | -3.991 | -2.706 |
| 4.869999999999834 | -4.662 | -3.997 | -2.714 |
| 4.874999999999834 | -4.667 | -4.003 | -2.722 |
| 4.879999999999833 | -4.672 | -4.009 | -2.73 |
| 4.884999999999834 | -4.677 | -4.015 | -2.738 |
| 4.889999999999833 | -4.683 | -4.021 | -2.746 |
| 4.894999999999833 | -4.688 | -4.027 | -2.754 |
| 4.899999999999833 | -4.693 | -4.033 | -2.762 |
| 4.904999999999833 | -4.698 | -4.039 | -2.77 |
| 4.909999999999833 | -4.703 | -4.045 | -2.778 |
| 4.914999999999833 | -4.709 | -4.051 | -2.786 |
| 4.919999999999832 | -4.714 | -4.057 | -2.794 |
| 4.924999999999833 | -4.719 | -4.063 | -2.802 |
| 4.929999999999832 | -4.724 | -4.069 | -2.81 |
| 4.934999999999832 | -4.73 | -4.075 | -2.818 |
| 4.939999999999832 | -4.735 | -4.081 | -2.826 |
| 4.944999999999832 | -4.74 | -4.087 | -2.834 |
| 4.949999999999832 | -4.745 | -4.093 | -2.842 |
| 4.954999999999832 | -4.75 | -4.099 | -2.85 |
| 4.959999999999832 | -4.756 | -4.105 | -2.858 |
| 4.964999999999832 | -4.761 | -4.111 | -2.866 |
| 4.969999999999831 | -4.766 | -4.117 | -2.874 |
| 4.974999999999831 | -4.771 | -4.123 | -2.881 |
| 4.97999999999983 | -4.776 | -4.129 | -2.889 |
| 4.984999999999831 | -4.782 | -4.135 | -2.897 |
| 4.98999999999983 | -4.787 | -4.141 | -2.905 |
| 4.994999999999831 | -4.792 | -4.147 | -2.913 |
| 4.99999999999983 | -4.797 | -4.153 | -2.921 |